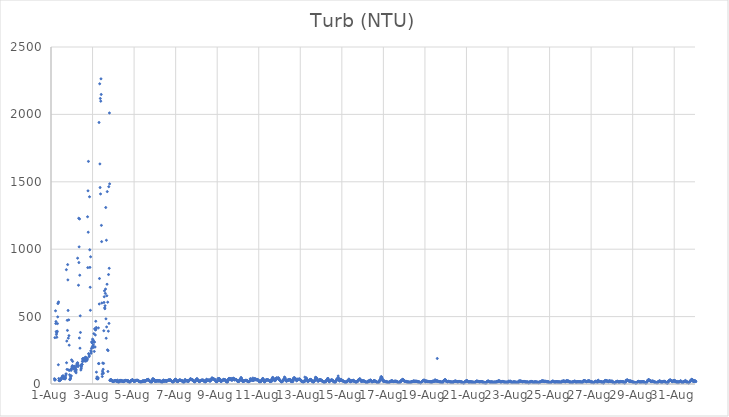
| Category | Turb (NTU) |
|---|---|
| 44774.166666666664 | 39.64 |
| 44774.177083333336 | 29.49 |
| 44774.1875 | 343.75 |
| 44774.197916666664 | 30 |
| 44774.208333333336 | 33.4 |
| 44774.21875 | 542.81 |
| 44774.229166666664 | 448.55 |
| 44774.239583333336 | 463.23 |
| 44774.25 | 389 |
| 44774.260416666664 | 366.88 |
| 44774.270833333336 | 378.59 |
| 44774.28125 | 346.4 |
| 44774.291666666664 | 385.65 |
| 44774.302083333336 | 391.27 |
| 44774.3125 | 447.91 |
| 44774.322916666664 | 498 |
| 44774.333333333336 | 596.85 |
| 44774.34375 | 601.07 |
| 44774.354166666664 | 142.81 |
| 44774.364583333336 | 608.79 |
| 44774.375 | 40.55 |
| 44774.385416666664 | 25.72 |
| 44774.395833333336 | 27.88 |
| 44774.40625 | 26.28 |
| 44774.416666666664 | 24.66 |
| 44774.427083333336 | 28.3 |
| 44774.4375 | 26.95 |
| 44774.447916666664 | 32.69 |
| 44774.458333333336 | 34.4 |
| 44774.46875 | 34.04 |
| 44774.479166666664 | 34.09 |
| 44774.489583333336 | 38.51 |
| 44774.5 | 38.87 |
| 44774.510416666664 | 40.91 |
| 44774.520833333336 | 49.12 |
| 44774.53125 | 48.4 |
| 44774.541666666664 | 52.52 |
| 44774.552083333336 | 58.51 |
| 44774.5625 | 52.9 |
| 44774.572916666664 | 54.88 |
| 44774.583333333336 | 60.88 |
| 44774.59375 | 56.37 |
| 44774.604166666664 | 54.12 |
| 44774.614583333336 | 48.3 |
| 44774.625 | 39.16 |
| 44774.635416666664 | 40.01 |
| 44774.645833333336 | 44.11 |
| 44774.65625 | 41.33 |
| 44774.666666666664 | 44.24 |
| 44774.677083333336 | 36.86 |
| 44774.6875 | 44.63 |
| 44774.697916666664 | 44.44 |
| 44774.708333333336 | 60.81 |
| 44774.71875 | 73.28 |
| 44774.729166666664 | 74.96 |
| 44774.739583333336 | 847.93 |
| 44774.75 | 157.62 |
| 44774.760416666664 | 318.34 |
| 44774.770833333336 | 108.39 |
| 44774.78125 | 472.36 |
| 44774.791666666664 | 397.58 |
| 44774.802083333336 | 885.79 |
| 44774.8125 | 772.22 |
| 44774.822916666664 | 545.61 |
| 44774.833333333336 | 340.16 |
| 44774.84375 | 104.51 |
| 44774.854166666664 | 475.64 |
| 44774.864583333336 | 358.76 |
| 44774.875 | 288.15 |
| 44774.885416666664 | 100.7 |
| 44774.895833333336 | 68.09 |
| 44774.90625 | 32.54 |
| 44774.916666666664 | 34.19 |
| 44774.927083333336 | 40.48 |
| 44774.9375 | 57.16 |
| 44774.947916666664 | 44.3 |
| 44774.958333333336 | 108.44 |
| 44774.96875 | 100.94 |
| 44774.979166666664 | 60.49 |
| 44774.989583333336 | 178.94 |
| 44775.0 | 117.27 |
| 44775.010416666664 | 126.28 |
| 44775.020833333336 | 128.56 |
| 44775.03125 | 136 |
| 44775.041666666664 | 167.64 |
| 44775.052083333336 | 131.18 |
| 44775.0625 | 122.96 |
| 44775.072916666664 | 111.94 |
| 44775.083333333336 | 116.35 |
| 44775.09375 | 129.78 |
| 44775.104166666664 | 121.05 |
| 44775.114583333336 | 131.84 |
| 44775.125 | 124.09 |
| 44775.135416666664 | 118.02 |
| 44775.145833333336 | 120.3 |
| 44775.15625 | 94.73 |
| 44775.166666666664 | 119.45 |
| 44775.177083333336 | 113.84 |
| 44775.1875 | 104.91 |
| 44775.197916666664 | 91.28 |
| 44775.208333333336 | 82.86 |
| 44775.21875 | 104.62 |
| 44775.229166666664 | 138.22 |
| 44775.239583333336 | 130.79 |
| 44775.25 | 150.78 |
| 44775.260416666664 | 144.89 |
| 44775.270833333336 | 157.25 |
| 44775.28125 | 933.41 |
| 44775.291666666664 | 155.7 |
| 44775.302083333336 | 129.28 |
| 44775.3125 | 140.03 |
| 44775.322916666664 | 732.73 |
| 44775.333333333336 | 1229.4 |
| 44775.34375 | 900.87 |
| 44775.354166666664 | 1017.32 |
| 44775.364583333336 | 341.19 |
| 44775.375 | 1224.41 |
| 44775.385416666664 | 807.12 |
| 44775.395833333336 | 265.68 |
| 44775.40625 | 505.68 |
| 44775.416666666664 | 382.37 |
| 44775.427083333336 | 135.81 |
| 44775.4375 | 103.84 |
| 44775.447916666664 | 112.31 |
| 44775.458333333336 | 118.88 |
| 44775.46875 | 130.75 |
| 44775.479166666664 | 146.87 |
| 44775.489583333336 | 144.89 |
| 44775.5 | 144.9 |
| 44775.510416666664 | 168.42 |
| 44775.520833333336 | 185.36 |
| 44775.53125 | 167.15 |
| 44775.541666666664 | 188.6 |
| 44775.552083333336 | 188.36 |
| 44775.5625 | 175.03 |
| 44775.572916666664 | 181.79 |
| 44775.583333333336 | 177.35 |
| 44775.59375 | 186.6 |
| 44775.604166666664 | 192.44 |
| 44775.614583333336 | 188.51 |
| 44775.625 | 187.43 |
| 44775.635416666664 | 172.45 |
| 44775.645833333336 | 168.81 |
| 44775.65625 | 198.53 |
| 44775.666666666664 | 192.33 |
| 44775.677083333336 | 191.73 |
| 44775.6875 | 182.39 |
| 44775.697916666664 | 195.37 |
| 44775.708333333336 | 172.12 |
| 44775.71875 | 182.09 |
| 44775.729166666664 | 180 |
| 44775.739583333336 | 178.01 |
| 44775.75 | 188.44 |
| 44775.760416666664 | 1240.64 |
| 44775.770833333336 | 863.31 |
| 44775.78125 | 1433.01 |
| 44775.791666666664 | 1126.01 |
| 44775.802083333336 | 1651.35 |
| 44775.8125 | 225.13 |
| 44775.822916666664 | 223.03 |
| 44775.833333333336 | 203.07 |
| 44775.84375 | 209.2 |
| 44775.854166666664 | 1388.83 |
| 44775.864583333336 | 995.66 |
| 44775.875 | 865.04 |
| 44775.885416666664 | 717.61 |
| 44775.895833333336 | 546.76 |
| 44775.90625 | 943.72 |
| 44775.916666666664 | 246.3 |
| 44775.927083333336 | 227.12 |
| 44775.9375 | 238.35 |
| 44775.947916666664 | 263.89 |
| 44775.958333333336 | 312.91 |
| 44775.96875 | 307.06 |
| 44775.979166666664 | 273.85 |
| 44775.989583333336 | 303.97 |
| 44776.0 | 332.7 |
| 44776.010416666664 | 281.81 |
| 44776.020833333336 | 313.37 |
| 44776.03125 | 325.6 |
| 44776.041666666664 | 289.59 |
| 44776.052083333336 | 271.32 |
| 44776.0625 | 373.22 |
| 44776.072916666664 | 314.95 |
| 44776.083333333336 | 241.73 |
| 44776.09375 | 310.02 |
| 44776.104166666664 | 409.22 |
| 44776.114583333336 | 407.71 |
| 44776.125 | 274.55 |
| 44776.135416666664 | 363.45 |
| 44776.145833333336 | 400.48 |
| 44776.15625 | 465.41 |
| 44776.166666666664 | 407.34 |
| 44776.177083333336 | 419.02 |
| 44776.1875 | 87.96 |
| 44776.197916666664 | 39.92 |
| 44776.208333333336 | 44.44 |
| 44776.21875 | 52.85 |
| 44776.229166666664 | 40.16 |
| 44776.239583333336 | 41.86 |
| 44776.25 | 37.81 |
| 44776.260416666664 | 38.15 |
| 44776.270833333336 | 45.25 |
| 44776.28125 | 416.27 |
| 44776.291666666664 | 151.71 |
| 44776.302083333336 | 151.39 |
| 44776.3125 | 1940.11 |
| 44776.322916666664 | 593.65 |
| 44776.333333333336 | 782.37 |
| 44776.34375 | 2227.01 |
| 44776.354166666664 | 1632.46 |
| 44776.364583333336 | 1457.48 |
| 44776.375 | 2118.02 |
| 44776.385416666664 | 1409.95 |
| 44776.395833333336 | 2098.01 |
| 44776.40625 | 2263.9 |
| 44776.416666666664 | 2148.02 |
| 44776.427083333336 | 1176.66 |
| 44776.4375 | 1056.24 |
| 44776.447916666664 | 600.7 |
| 44776.458333333336 | 73.83 |
| 44776.46875 | 55.41 |
| 44776.479166666664 | 95.75 |
| 44776.489583333336 | 155.37 |
| 44776.5 | 84.63 |
| 44776.510416666664 | 109.05 |
| 44776.520833333336 | 78.53 |
| 44776.53125 | 152.65 |
| 44776.541666666664 | 395 |
| 44776.552083333336 | 605.02 |
| 44776.5625 | 647.35 |
| 44776.572916666664 | 691.17 |
| 44776.583333333336 | 565.55 |
| 44776.59375 | 558.28 |
| 44776.604166666664 | 580.69 |
| 44776.614583333336 | 672.17 |
| 44776.625 | 704.15 |
| 44776.635416666664 | 1309.23 |
| 44776.645833333336 | 483.33 |
| 44776.65625 | 339.5 |
| 44776.666666666664 | 1066.35 |
| 44776.677083333336 | 423.31 |
| 44776.6875 | 654.82 |
| 44776.697916666664 | 740 |
| 44776.708333333336 | 1427.18 |
| 44776.71875 | 253.48 |
| 44776.729166666664 | 606.99 |
| 44776.739583333336 | 92.95 |
| 44776.75 | 247.96 |
| 44776.760416666664 | 391.8 |
| 44776.770833333336 | 811.92 |
| 44776.78125 | 1463.68 |
| 44776.791666666664 | 449.57 |
| 44776.802083333336 | 858.36 |
| 44776.8125 | 2010.73 |
| 44776.822916666664 | 1484.66 |
| 44776.833333333336 | 28.2 |
| 44776.84375 | 25.92 |
| 44776.854166666664 | 28.86 |
| 44776.864583333336 | 32.21 |
| 44776.875 | 32.67 |
| 44776.885416666664 | 28.52 |
| 44776.895833333336 | 32.18 |
| 44776.90625 | 26.48 |
| 44776.916666666664 | 26.51 |
| 44776.927083333336 | 27.24 |
| 44776.9375 | 22.49 |
| 44776.947916666664 | 21.96 |
| 44776.958333333336 | 22.24 |
| 44776.96875 | 18.54 |
| 44776.979166666664 | 18.39 |
| 44776.989583333336 | 16.93 |
| 44777.0 | 17.83 |
| 44777.010416666664 | 20 |
| 44777.020833333336 | 19.98 |
| 44777.03125 | 22.9 |
| 44777.041666666664 | 22.95 |
| 44777.052083333336 | 22.93 |
| 44777.0625 | 24.94 |
| 44777.072916666664 | 25.53 |
| 44777.083333333336 | 27.63 |
| 44777.09375 | 24.48 |
| 44777.104166666664 | 25.06 |
| 44777.114583333336 | 25.37 |
| 44777.125 | 22.61 |
| 44777.135416666664 | 24.18 |
| 44777.145833333336 | 22.41 |
| 44777.15625 | 21.91 |
| 44777.166666666664 | 21.86 |
| 44777.177083333336 | 21.95 |
| 44777.1875 | 20.81 |
| 44777.197916666664 | 18.48 |
| 44777.208333333336 | 29.01 |
| 44777.21875 | 18.15 |
| 44777.229166666664 | 15.44 |
| 44777.239583333336 | 13.22 |
| 44777.25 | 13.64 |
| 44777.260416666664 | 16.74 |
| 44777.270833333336 | 18.9 |
| 44777.28125 | 17.37 |
| 44777.291666666664 | 15.93 |
| 44777.302083333336 | 18.65 |
| 44777.3125 | 23.11 |
| 44777.322916666664 | 27.88 |
| 44777.333333333336 | 26.24 |
| 44777.34375 | 24.51 |
| 44777.354166666664 | 23.02 |
| 44777.364583333336 | 25.14 |
| 44777.375 | 23.44 |
| 44777.385416666664 | 26.29 |
| 44777.395833333336 | 21.91 |
| 44777.40625 | 23.1 |
| 44777.416666666664 | 22.91 |
| 44777.427083333336 | 19.35 |
| 44777.4375 | 22.28 |
| 44777.447916666664 | 22.15 |
| 44777.458333333336 | 19.94 |
| 44777.46875 | 19.51 |
| 44777.479166666664 | 20.19 |
| 44777.489583333336 | 17.59 |
| 44777.5 | 18.17 |
| 44777.510416666664 | 18.55 |
| 44777.520833333336 | 25.78 |
| 44777.53125 | 23.03 |
| 44777.541666666664 | 22.67 |
| 44777.552083333336 | 24.82 |
| 44777.5625 | 24.93 |
| 44777.572916666664 | 26.02 |
| 44777.583333333336 | 27.19 |
| 44777.59375 | 23.31 |
| 44777.604166666664 | 24.3 |
| 44777.614583333336 | 23.43 |
| 44777.625 | 26.28 |
| 44777.635416666664 | 25.19 |
| 44777.645833333336 | 24.85 |
| 44777.65625 | 24.41 |
| 44777.666666666664 | 25.37 |
| 44777.677083333336 | 22.31 |
| 44777.6875 | 23.49 |
| 44777.697916666664 | 20.06 |
| 44777.708333333336 | 20.73 |
| 44777.71875 | 24.73 |
| 44777.729166666664 | 20.58 |
| 44777.739583333336 | 21.12 |
| 44777.75 | 16.46 |
| 44777.760416666664 | 15.09 |
| 44777.770833333336 | 12.92 |
| 44777.78125 | 12.91 |
| 44777.791666666664 | 13.31 |
| 44777.802083333336 | 13.36 |
| 44777.8125 | 17.77 |
| 44777.822916666664 | 19.4 |
| 44777.833333333336 | 22.31 |
| 44777.84375 | 24.76 |
| 44777.854166666664 | 24.55 |
| 44777.864583333336 | 26.44 |
| 44777.875 | 26.97 |
| 44777.885416666664 | 24.75 |
| 44777.895833333336 | 26.06 |
| 44777.90625 | 29.63 |
| 44777.916666666664 | 32.61 |
| 44777.927083333336 | 29.68 |
| 44777.9375 | 29.16 |
| 44777.947916666664 | 27.05 |
| 44777.958333333336 | 26.28 |
| 44777.96875 | 24.08 |
| 44777.979166666664 | 20.38 |
| 44777.989583333336 | 20.87 |
| 44778.0 | 21.48 |
| 44778.010416666664 | 21.46 |
| 44778.020833333336 | 20.14 |
| 44778.03125 | 19.72 |
| 44778.041666666664 | 20.67 |
| 44778.052083333336 | 21.99 |
| 44778.0625 | 26.86 |
| 44778.072916666664 | 25.33 |
| 44778.083333333336 | 26.08 |
| 44778.09375 | 24.47 |
| 44778.104166666664 | 25.07 |
| 44778.114583333336 | 26.1 |
| 44778.125 | 27.08 |
| 44778.135416666664 | 27.34 |
| 44778.145833333336 | 29.23 |
| 44778.15625 | 26.98 |
| 44778.166666666664 | 25.42 |
| 44778.177083333336 | 25.6 |
| 44778.1875 | 24.57 |
| 44778.197916666664 | 25.76 |
| 44778.208333333336 | 23.83 |
| 44778.21875 | 20.6 |
| 44778.229166666664 | 20.6 |
| 44778.239583333336 | 18.85 |
| 44778.25 | 17.88 |
| 44778.260416666664 | 19.64 |
| 44778.270833333336 | 16.89 |
| 44778.28125 | 16.39 |
| 44778.291666666664 | 15.57 |
| 44778.302083333336 | 14.63 |
| 44778.3125 | 14.58 |
| 44778.322916666664 | 16.35 |
| 44778.333333333336 | 16.39 |
| 44778.34375 | 16.96 |
| 44778.354166666664 | 17.45 |
| 44778.364583333336 | 14.93 |
| 44778.375 | 19.86 |
| 44778.385416666664 | 16.44 |
| 44778.395833333336 | 18.63 |
| 44778.40625 | 21.94 |
| 44778.416666666664 | 20.59 |
| 44778.427083333336 | 23.69 |
| 44778.4375 | 19.83 |
| 44778.447916666664 | 20.82 |
| 44778.458333333336 | 21.47 |
| 44778.46875 | 20.3 |
| 44778.479166666664 | 22.93 |
| 44778.489583333336 | 24.6 |
| 44778.5 | 22.45 |
| 44778.510416666664 | 21.43 |
| 44778.520833333336 | 19.02 |
| 44778.53125 | 19.92 |
| 44778.541666666664 | 21.89 |
| 44778.552083333336 | 24.38 |
| 44778.5625 | 24.25 |
| 44778.572916666664 | 24.54 |
| 44778.583333333336 | 25.56 |
| 44778.59375 | 24.62 |
| 44778.604166666664 | 27.36 |
| 44778.614583333336 | 30.33 |
| 44778.625 | 31.84 |
| 44778.635416666664 | 31.54 |
| 44778.645833333336 | 32.99 |
| 44778.65625 | 31.66 |
| 44778.666666666664 | 33.48 |
| 44778.677083333336 | 35.28 |
| 44778.6875 | 30.57 |
| 44778.697916666664 | 27.21 |
| 44778.708333333336 | 25.19 |
| 44778.71875 | 26.53 |
| 44778.729166666664 | 25.97 |
| 44778.739583333336 | 24.68 |
| 44778.75 | 22.19 |
| 44778.760416666664 | 21.18 |
| 44778.770833333336 | 20.47 |
| 44778.78125 | 18.44 |
| 44778.791666666664 | 17.36 |
| 44778.802083333336 | 16.29 |
| 44778.8125 | 14.83 |
| 44778.822916666664 | 13.38 |
| 44778.833333333336 | 12.47 |
| 44778.84375 | 12.78 |
| 44778.854166666664 | 19.14 |
| 44778.864583333336 | 21.14 |
| 44778.875 | 26.38 |
| 44778.885416666664 | 31.53 |
| 44778.895833333336 | 39.58 |
| 44778.90625 | 25.45 |
| 44778.916666666664 | 37.96 |
| 44778.927083333336 | 27.51 |
| 44778.9375 | 36.11 |
| 44778.947916666664 | 33.23 |
| 44778.958333333336 | 29.45 |
| 44778.96875 | 31.62 |
| 44778.979166666664 | 28.3 |
| 44778.989583333336 | 23.62 |
| 44779.0 | 20.22 |
| 44779.010416666664 | 19.85 |
| 44779.020833333336 | 21.3 |
| 44779.03125 | 24.31 |
| 44779.041666666664 | 26.28 |
| 44779.052083333336 | 21.26 |
| 44779.0625 | 18.94 |
| 44779.072916666664 | 24.14 |
| 44779.083333333336 | 25.21 |
| 44779.09375 | 24.64 |
| 44779.104166666664 | 25.42 |
| 44779.114583333336 | 25.65 |
| 44779.125 | 23.64 |
| 44779.135416666664 | 22.81 |
| 44779.145833333336 | 22.08 |
| 44779.15625 | 22.07 |
| 44779.166666666664 | 21.76 |
| 44779.177083333336 | 23.47 |
| 44779.1875 | 24.53 |
| 44779.197916666664 | 24.91 |
| 44779.208333333336 | 25.54 |
| 44779.21875 | 24.35 |
| 44779.229166666664 | 23.73 |
| 44779.239583333336 | 22.76 |
| 44779.25 | 23.42 |
| 44779.260416666664 | 21.71 |
| 44779.270833333336 | 18.66 |
| 44779.28125 | 19.19 |
| 44779.291666666664 | 15.53 |
| 44779.302083333336 | 16.21 |
| 44779.3125 | 15.66 |
| 44779.322916666664 | 21.08 |
| 44779.333333333336 | 16.62 |
| 44779.34375 | 16.29 |
| 44779.354166666664 | 13.74 |
| 44779.364583333336 | 14.75 |
| 44779.375 | 19.15 |
| 44779.385416666664 | 18.52 |
| 44779.395833333336 | 25.83 |
| 44779.40625 | 24.16 |
| 44779.416666666664 | 29.48 |
| 44779.427083333336 | 27.05 |
| 44779.4375 | 23.97 |
| 44779.447916666664 | 22.44 |
| 44779.458333333336 | 22.7 |
| 44779.46875 | 20.39 |
| 44779.479166666664 | 22.51 |
| 44779.489583333336 | 22.28 |
| 44779.5 | 23.9 |
| 44779.510416666664 | 26.09 |
| 44779.520833333336 | 24.08 |
| 44779.53125 | 22.42 |
| 44779.541666666664 | 21.75 |
| 44779.552083333336 | 18.89 |
| 44779.5625 | 19.58 |
| 44779.572916666664 | 20.99 |
| 44779.583333333336 | 23.35 |
| 44779.59375 | 26.36 |
| 44779.604166666664 | 25.3 |
| 44779.614583333336 | 26.45 |
| 44779.625 | 26.3 |
| 44779.635416666664 | 26.36 |
| 44779.645833333336 | 28.36 |
| 44779.65625 | 28.86 |
| 44779.666666666664 | 28 |
| 44779.677083333336 | 30.15 |
| 44779.6875 | 29.37 |
| 44779.697916666664 | 29.18 |
| 44779.708333333336 | 28.98 |
| 44779.71875 | 26.95 |
| 44779.729166666664 | 29.7 |
| 44779.739583333336 | 32.09 |
| 44779.75 | 29.95 |
| 44779.760416666664 | 27.62 |
| 44779.770833333336 | 26.67 |
| 44779.78125 | 24.71 |
| 44779.791666666664 | 24.14 |
| 44779.802083333336 | 20.82 |
| 44779.8125 | 20.77 |
| 44779.822916666664 | 19.02 |
| 44779.833333333336 | 17.43 |
| 44779.84375 | 15.54 |
| 44779.854166666664 | 15.04 |
| 44779.864583333336 | 13.36 |
| 44779.875 | 15.18 |
| 44779.885416666664 | 14.92 |
| 44779.895833333336 | 19.34 |
| 44779.90625 | 19.68 |
| 44779.916666666664 | 22.19 |
| 44779.927083333336 | 24.38 |
| 44779.9375 | 26.14 |
| 44779.947916666664 | 27.36 |
| 44779.958333333336 | 29.2 |
| 44779.96875 | 32.59 |
| 44779.979166666664 | 33.27 |
| 44779.989583333336 | 36.06 |
| 44780.0 | 32.14 |
| 44780.010416666664 | 30.98 |
| 44780.020833333336 | 30.12 |
| 44780.03125 | 28.97 |
| 44780.041666666664 | 27.01 |
| 44780.052083333336 | 23.65 |
| 44780.0625 | 20.68 |
| 44780.072916666664 | 19.77 |
| 44780.083333333336 | 18.6 |
| 44780.09375 | 17.27 |
| 44780.104166666664 | 17.65 |
| 44780.114583333336 | 19.15 |
| 44780.125 | 23.35 |
| 44780.135416666664 | 23.99 |
| 44780.145833333336 | 25.91 |
| 44780.15625 | 25.74 |
| 44780.166666666664 | 28.09 |
| 44780.177083333336 | 29.21 |
| 44780.1875 | 28.32 |
| 44780.197916666664 | 29.52 |
| 44780.208333333336 | 28.57 |
| 44780.21875 | 30.27 |
| 44780.229166666664 | 27.72 |
| 44780.239583333336 | 26.54 |
| 44780.25 | 26.31 |
| 44780.260416666664 | 25.24 |
| 44780.270833333336 | 25.65 |
| 44780.28125 | 25.65 |
| 44780.291666666664 | 25.51 |
| 44780.302083333336 | 23.49 |
| 44780.3125 | 23.11 |
| 44780.322916666664 | 20.71 |
| 44780.333333333336 | 20.9 |
| 44780.34375 | 17.69 |
| 44780.354166666664 | 15.28 |
| 44780.364583333336 | 14.29 |
| 44780.375 | 13.45 |
| 44780.385416666664 | 13.88 |
| 44780.395833333336 | 16.5 |
| 44780.40625 | 13.85 |
| 44780.416666666664 | 16.2 |
| 44780.427083333336 | 19.53 |
| 44780.4375 | 29.33 |
| 44780.447916666664 | 28.59 |
| 44780.458333333336 | 33.27 |
| 44780.46875 | 27.12 |
| 44780.479166666664 | 26.81 |
| 44780.489583333336 | 23.73 |
| 44780.5 | 24.43 |
| 44780.510416666664 | 23.8 |
| 44780.520833333336 | 25.07 |
| 44780.53125 | 22.36 |
| 44780.541666666664 | 26.82 |
| 44780.552083333336 | 24.99 |
| 44780.5625 | 24.29 |
| 44780.572916666664 | 22.87 |
| 44780.583333333336 | 21.65 |
| 44780.59375 | 20.57 |
| 44780.604166666664 | 20 |
| 44780.614583333336 | 18.24 |
| 44780.625 | 22.46 |
| 44780.635416666664 | 22.84 |
| 44780.645833333336 | 26.62 |
| 44780.65625 | 27.07 |
| 44780.666666666664 | 28.09 |
| 44780.677083333336 | 30.67 |
| 44780.6875 | 32.14 |
| 44780.697916666664 | 36.49 |
| 44780.708333333336 | 38.56 |
| 44780.71875 | 35.88 |
| 44780.729166666664 | 37.45 |
| 44780.739583333336 | 35.75 |
| 44780.75 | 34.31 |
| 44780.760416666664 | 33.96 |
| 44780.770833333336 | 32.64 |
| 44780.78125 | 31.79 |
| 44780.791666666664 | 29.36 |
| 44780.802083333336 | 30.29 |
| 44780.8125 | 30.67 |
| 44780.822916666664 | 31.07 |
| 44780.833333333336 | 25.37 |
| 44780.84375 | 26.19 |
| 44780.854166666664 | 23.99 |
| 44780.864583333336 | 23.03 |
| 44780.875 | 21.52 |
| 44780.885416666664 | 18.78 |
| 44780.895833333336 | 17 |
| 44780.90625 | 17.75 |
| 44780.916666666664 | 14.55 |
| 44780.927083333336 | 17.9 |
| 44780.9375 | 16.07 |
| 44780.947916666664 | 22.92 |
| 44780.958333333336 | 24.28 |
| 44780.96875 | 27.53 |
| 44780.979166666664 | 30.71 |
| 44780.989583333336 | 33.68 |
| 44781.0 | 29.5 |
| 44781.010416666664 | 35.68 |
| 44781.020833333336 | 35.81 |
| 44781.03125 | 40.46 |
| 44781.041666666664 | 32.54 |
| 44781.052083333336 | 31.15 |
| 44781.0625 | 30.22 |
| 44781.072916666664 | 31 |
| 44781.083333333336 | 26.57 |
| 44781.09375 | 25.01 |
| 44781.104166666664 | 22.48 |
| 44781.114583333336 | 20.8 |
| 44781.125 | 18.06 |
| 44781.135416666664 | 17.52 |
| 44781.145833333336 | 17.27 |
| 44781.15625 | 18.56 |
| 44781.166666666664 | 21.21 |
| 44781.177083333336 | 24.95 |
| 44781.1875 | 24.15 |
| 44781.197916666664 | 26.03 |
| 44781.208333333336 | 24.16 |
| 44781.21875 | 26.34 |
| 44781.229166666664 | 27.82 |
| 44781.239583333336 | 26.52 |
| 44781.25 | 28.35 |
| 44781.260416666664 | 27.14 |
| 44781.270833333336 | 28.96 |
| 44781.28125 | 29.27 |
| 44781.291666666664 | 26.31 |
| 44781.302083333336 | 27.37 |
| 44781.3125 | 30.55 |
| 44781.322916666664 | 28.7 |
| 44781.333333333336 | 26.06 |
| 44781.34375 | 25.06 |
| 44781.354166666664 | 21.69 |
| 44781.364583333336 | 22.53 |
| 44781.375 | 22.62 |
| 44781.385416666664 | 21.09 |
| 44781.395833333336 | 18.46 |
| 44781.40625 | 15.36 |
| 44781.416666666664 | 18.58 |
| 44781.427083333336 | 15.15 |
| 44781.4375 | 15.84 |
| 44781.447916666664 | 18.62 |
| 44781.458333333336 | 25.82 |
| 44781.46875 | 29.7 |
| 44781.479166666664 | 22.52 |
| 44781.489583333336 | 35.39 |
| 44781.5 | 31.09 |
| 44781.510416666664 | 27.29 |
| 44781.520833333336 | 27.65 |
| 44781.53125 | 28.91 |
| 44781.541666666664 | 25.55 |
| 44781.55210648148 | 25.52 |
| 44781.5625 | 26.21 |
| 44781.572916666664 | 25.73 |
| 44781.583333333336 | 28.29 |
| 44781.59375 | 30.04 |
| 44781.604166666664 | 29.49 |
| 44781.614583333336 | 23.44 |
| 44781.625 | 25.98 |
| 44781.635416666664 | 31.28 |
| 44781.645833333336 | 23.66 |
| 44781.65625 | 19.69 |
| 44781.666666666664 | 23.84 |
| 44781.677083333336 | 27.04 |
| 44781.6875 | 30.27 |
| 44781.697916666664 | 27.7 |
| 44781.708333333336 | 33.34 |
| 44781.71875 | 30.07 |
| 44781.729166666664 | 36.31 |
| 44781.739583333336 | 39.67 |
| 44781.75 | 46.39 |
| 44781.760416666664 | 42.37 |
| 44781.770833333336 | 38.59 |
| 44781.78125 | 39.69 |
| 44781.791666666664 | 38.06 |
| 44781.802083333336 | 36.14 |
| 44781.8125 | 39.71 |
| 44781.822916666664 | 36.1 |
| 44781.833333333336 | 36.67 |
| 44781.84375 | 35.84 |
| 44781.854166666664 | 34.03 |
| 44781.864583333336 | 34.54 |
| 44781.875 | 34.55 |
| 44781.885416666664 | 31.54 |
| 44781.895833333336 | 29.33 |
| 44781.90625 | 29.15 |
| 44781.916666666664 | 24.82 |
| 44781.927083333336 | 24.65 |
| 44781.9375 | 20.72 |
| 44781.947916666664 | 16.14 |
| 44781.958333333336 | 17.42 |
| 44781.96875 | 17.68 |
| 44781.979166666664 | 17.62 |
| 44781.989583333336 | 20.64 |
| 44782.0 | 18.11 |
| 44782.010416666664 | 21.6 |
| 44782.020833333336 | 25.19 |
| 44782.03125 | 40.21 |
| 44782.041666666664 | 35.71 |
| 44782.052083333336 | 30.91 |
| 44782.0625 | 35.94 |
| 44782.072916666664 | 35.74 |
| 44782.083333333336 | 42.02 |
| 44782.09375 | 36.93 |
| 44782.104166666664 | 39.29 |
| 44782.114583333336 | 37.51 |
| 44782.125 | 35.2 |
| 44782.135416666664 | 29.12 |
| 44782.145833333336 | 27.69 |
| 44782.15625 | 24.23 |
| 44782.166666666664 | 20.68 |
| 44782.177083333336 | 18.72 |
| 44782.1875 | 17.67 |
| 44782.197916666664 | 18.62 |
| 44782.208333333336 | 22.48 |
| 44782.21875 | 27.05 |
| 44782.229166666664 | 25.88 |
| 44782.239583333336 | 26.12 |
| 44782.25 | 24.88 |
| 44782.260416666664 | 25.69 |
| 44782.270833333336 | 29.62 |
| 44782.28125 | 29.41 |
| 44782.291666666664 | 30.69 |
| 44782.302083333336 | 30.72 |
| 44782.3125 | 34.63 |
| 44782.322916666664 | 33.28 |
| 44782.333333333336 | 32.37 |
| 44782.34375 | 30.43 |
| 44782.354166666664 | 31.99 |
| 44782.364583333336 | 32.06 |
| 44782.375 | 31.59 |
| 44782.385416666664 | 29.17 |
| 44782.395833333336 | 27.75 |
| 44782.40625 | 24.96 |
| 44782.416666666664 | 23.8 |
| 44782.427083333336 | 20.84 |
| 44782.4375 | 19.67 |
| 44782.447916666664 | 18.53 |
| 44782.458333333336 | 14.46 |
| 44782.46875 | 15.44 |
| 44782.479166666664 | 13.07 |
| 44782.489583333336 | 15.22 |
| 44782.5 | 17.38 |
| 44782.510416666664 | 21.51 |
| 44782.520833333336 | 28.73 |
| 44782.53125 | 34.59 |
| 44782.541666666664 | 33.59 |
| 44782.552083333336 | 37.21 |
| 44782.5625 | 40.24 |
| 44782.572916666664 | 35.95 |
| 44782.583333333336 | 40.8 |
| 44782.59375 | 41.02 |
| 44782.604166666664 | 36.64 |
| 44782.614583333336 | 33.16 |
| 44782.625 | 35.76 |
| 44782.635416666664 | 36.94 |
| 44782.645833333336 | 39.36 |
| 44782.65625 | 33.34 |
| 44782.666666666664 | 29.8 |
| 44782.677083333336 | 40.8 |
| 44782.6875 | 30.6 |
| 44782.697916666664 | 30.99 |
| 44782.708333333336 | 28.62 |
| 44782.71875 | 30.34 |
| 44782.729166666664 | 31.32 |
| 44782.739583333336 | 30.85 |
| 44782.75 | 41.32 |
| 44782.760416666664 | 37.01 |
| 44782.770833333336 | 37.58 |
| 44782.78125 | 41.56 |
| 44782.791666666664 | 42.64 |
| 44782.802083333336 | 40.39 |
| 44782.8125 | 35.39 |
| 44782.822916666664 | 31.65 |
| 44782.833333333336 | 30.47 |
| 44782.84375 | 32 |
| 44782.854166666664 | 32.49 |
| 44782.864583333336 | 32.92 |
| 44782.875 | 33.56 |
| 44782.885416666664 | 33.93 |
| 44782.895833333336 | 32.43 |
| 44782.90625 | 32.65 |
| 44782.916666666664 | 30.85 |
| 44782.927083333336 | 28.12 |
| 44782.9375 | 30.02 |
| 44782.947916666664 | 28.24 |
| 44782.958333333336 | 24.29 |
| 44782.96875 | 22.57 |
| 44782.979166666664 | 20.74 |
| 44782.989583333336 | 18.61 |
| 44783.0 | 18.29 |
| 44783.010416666664 | 18.53 |
| 44783.020833333336 | 18.4 |
| 44783.03125 | 18.41 |
| 44783.041666666664 | 24.33 |
| 44783.052083333336 | 24.1 |
| 44783.0625 | 19.63 |
| 44783.072916666664 | 28.21 |
| 44783.083333333336 | 28.92 |
| 44783.09375 | 30.22 |
| 44783.104166666664 | 30.9 |
| 44783.114583333336 | 38.73 |
| 44783.125 | 37.09 |
| 44783.135416666664 | 40.71 |
| 44783.145833333336 | 48.61 |
| 44783.15625 | 42.04 |
| 44783.166666666664 | 43.63 |
| 44783.177083333336 | 37.02 |
| 44783.1875 | 32.71 |
| 44783.197916666664 | 29.38 |
| 44783.208333333336 | 29.5 |
| 44783.21875 | 21.3 |
| 44783.229166666664 | 18.16 |
| 44783.239583333336 | 19 |
| 44783.25 | 19.91 |
| 44783.260416666664 | 23.49 |
| 44783.270833333336 | 22.81 |
| 44783.28125 | 22.08 |
| 44783.291666666664 | 21.66 |
| 44783.302083333336 | 21.77 |
| 44783.3125 | 23.19 |
| 44783.322916666664 | 24.4 |
| 44783.333333333336 | 24.56 |
| 44783.34375 | 25.06 |
| 44783.354166666664 | 25.55 |
| 44783.364583333336 | 27.66 |
| 44783.375 | 26.25 |
| 44783.385416666664 | 25.73 |
| 44783.395833333336 | 27.98 |
| 44783.40625 | 25.04 |
| 44783.416666666664 | 25.33 |
| 44783.427083333336 | 23.43 |
| 44783.4375 | 25.26 |
| 44783.447916666664 | 22.33 |
| 44783.458333333336 | 20.89 |
| 44783.46875 | 21.55 |
| 44783.479166666664 | 17.46 |
| 44783.489583333336 | 16.26 |
| 44783.5 | 17.26 |
| 44783.510416666664 | 18.86 |
| 44783.520833333336 | 18.12 |
| 44783.53125 | 18.1 |
| 44783.541666666664 | 18.12 |
| 44783.552083333336 | 20.68 |
| 44783.5625 | 20.4 |
| 44783.572916666664 | 22.19 |
| 44783.583333333336 | 27.14 |
| 44783.59375 | 39.43 |
| 44783.604166666664 | 36.48 |
| 44783.614583333336 | 31.31 |
| 44783.625 | 30.02 |
| 44783.635416666664 | 36.46 |
| 44783.645833333336 | 33.39 |
| 44783.65625 | 28.84 |
| 44783.666666666664 | 29.63 |
| 44783.677083333336 | 30.18 |
| 44783.6875 | 27.87 |
| 44783.697916666664 | 28.45 |
| 44783.708333333336 | 27.07 |
| 44783.71875 | 44.55 |
| 44783.729166666664 | 32.47 |
| 44783.739583333336 | 26.69 |
| 44783.75 | 26.4 |
| 44783.760416666664 | 29.61 |
| 44783.770833333336 | 33.1 |
| 44783.78125 | 30.17 |
| 44783.791666666664 | 34.42 |
| 44783.802083333336 | 40.21 |
| 44783.8125 | 35.97 |
| 44783.822916666664 | 37.33 |
| 44783.833333333336 | 37.24 |
| 44783.84375 | 35.53 |
| 44783.854166666664 | 32.03 |
| 44783.864583333336 | 31.19 |
| 44783.875 | 30.31 |
| 44783.885416666664 | 31.62 |
| 44783.895833333336 | 31.77 |
| 44783.90625 | 34.88 |
| 44783.916666666664 | 35.09 |
| 44783.927083333336 | 33.73 |
| 44783.9375 | 32.44 |
| 44783.947916666664 | 30.95 |
| 44783.958333333336 | 30.35 |
| 44783.96875 | 29.6 |
| 44783.979166666664 | 28.3 |
| 44783.989583333336 | 26.25 |
| 44784.0 | 23.23 |
| 44784.010416666664 | 23.52 |
| 44784.020833333336 | 18.26 |
| 44784.03125 | 17.4 |
| 44784.041666666664 | 17.17 |
| 44784.052083333336 | 16.52 |
| 44784.0625 | 16.17 |
| 44784.072916666664 | 16.82 |
| 44784.083333333336 | 17.8 |
| 44784.09375 | 18.27 |
| 44784.104166666664 | 21.88 |
| 44784.114583333336 | 21.7 |
| 44784.125 | 24.56 |
| 44784.135416666664 | 22.98 |
| 44784.145833333336 | 30.27 |
| 44784.15625 | 30.31 |
| 44784.166666666664 | 34.86 |
| 44784.177083333336 | 37.22 |
| 44784.1875 | 39.8 |
| 44784.197916666664 | 41.33 |
| 44784.208333333336 | 36.99 |
| 44784.21875 | 34.24 |
| 44784.229166666664 | 32.15 |
| 44784.239583333336 | 29.56 |
| 44784.25 | 24.89 |
| 44784.260416666664 | 20.59 |
| 44784.270833333336 | 15.93 |
| 44784.28125 | 16.53 |
| 44784.291666666664 | 14.97 |
| 44784.302083333336 | 19.66 |
| 44784.3125 | 22.79 |
| 44784.322916666664 | 26.26 |
| 44784.333333333336 | 28.05 |
| 44784.34375 | 27.23 |
| 44784.354166666664 | 30.11 |
| 44784.364583333336 | 28.48 |
| 44784.375 | 31.62 |
| 44784.385416666664 | 30.37 |
| 44784.395833333336 | 30.29 |
| 44784.40625 | 31.45 |
| 44784.416666666664 | 30.91 |
| 44784.427083333336 | 30.95 |
| 44784.4375 | 30.47 |
| 44784.447916666664 | 28.6 |
| 44784.458333333336 | 30.04 |
| 44784.46875 | 28.02 |
| 44784.479166666664 | 26.72 |
| 44784.489583333336 | 26.06 |
| 44784.5 | 24.59 |
| 44784.510416666664 | 25.22 |
| 44784.520833333336 | 22.63 |
| 44784.53125 | 20.49 |
| 44784.541666666664 | 19.79 |
| 44784.552083333336 | 17.73 |
| 44784.5625 | 19.1 |
| 44784.572916666664 | 17.61 |
| 44784.583333333336 | 19.25 |
| 44784.59375 | 20.41 |
| 44784.604166666664 | 29.74 |
| 44784.614583333336 | 27.93 |
| 44784.625 | 34.85 |
| 44784.635416666664 | 37.74 |
| 44784.645833333336 | 22.78 |
| 44784.65625 | 33.22 |
| 44784.666666666664 | 48.78 |
| 44784.677083333336 | 45.39 |
| 44784.6875 | 46.24 |
| 44784.697916666664 | 36.72 |
| 44784.708333333336 | 32.09 |
| 44784.71875 | 35.03 |
| 44784.729166666664 | 35.65 |
| 44784.739583333336 | 34.37 |
| 44784.75 | 34.54 |
| 44784.760416666664 | 34.57 |
| 44784.770833333336 | 25.5 |
| 44784.78125 | 23.08 |
| 44784.791666666664 | 26.74 |
| 44784.802083333336 | 27 |
| 44784.8125 | 30.04 |
| 44784.822916666664 | 34.92 |
| 44784.833333333336 | 32.05 |
| 44784.84375 | 43.11 |
| 44784.854166666664 | 44.85 |
| 44784.864583333336 | 43.62 |
| 44784.875 | 41.22 |
| 44784.885416666664 | 41.07 |
| 44784.895833333336 | 41.27 |
| 44784.90625 | 41.62 |
| 44784.916666666664 | 41.51 |
| 44784.927083333336 | 45.14 |
| 44784.9375 | 44.31 |
| 44784.947916666664 | 45.74 |
| 44784.958333333336 | 40.61 |
| 44784.96875 | 40.58 |
| 44784.979166666664 | 35.47 |
| 44784.989583333336 | 32.6 |
| 44785.0 | 31.2 |
| 44785.010416666664 | 28.79 |
| 44785.020833333336 | 26.83 |
| 44785.03125 | 25.75 |
| 44785.041666666664 | 23.43 |
| 44785.052083333336 | 24.61 |
| 44785.0625 | 20.78 |
| 44785.072916666664 | 17.4 |
| 44785.083333333336 | 17.16 |
| 44785.09375 | 16.68 |
| 44785.104166666664 | 14.71 |
| 44785.114583333336 | 16.59 |
| 44785.125 | 17.81 |
| 44785.135416666664 | 18.15 |
| 44785.145833333336 | 20.67 |
| 44785.15625 | 26.52 |
| 44785.166666666664 | 21.87 |
| 44785.177083333336 | 26.54 |
| 44785.1875 | 29.25 |
| 44785.197916666664 | 34.32 |
| 44785.208333333336 | 31.87 |
| 44785.21875 | 38.58 |
| 44785.229166666664 | 35.39 |
| 44785.239583333336 | 51.61 |
| 44785.25 | 41.55 |
| 44785.260416666664 | 46.25 |
| 44785.270833333336 | 43.66 |
| 44785.28125 | 36.93 |
| 44785.291666666664 | 29.87 |
| 44785.302083333336 | 27.91 |
| 44785.3125 | 24.8 |
| 44785.322916666664 | 20.92 |
| 44785.333333333336 | 22.17 |
| 44785.34375 | 23.2 |
| 44785.354166666664 | 22.79 |
| 44785.364583333336 | 23.98 |
| 44785.375 | 26.28 |
| 44785.385416666664 | 26.57 |
| 44785.395833333336 | 28.87 |
| 44785.40625 | 28.17 |
| 44785.416666666664 | 29.64 |
| 44785.427083333336 | 28.09 |
| 44785.4375 | 29.2 |
| 44785.447916666664 | 32.24 |
| 44785.458333333336 | 31.36 |
| 44785.46875 | 34.1 |
| 44785.479166666664 | 32.32 |
| 44785.489583333336 | 32.04 |
| 44785.5 | 32.41 |
| 44785.510416666664 | 30.19 |
| 44785.520833333336 | 29.05 |
| 44785.53125 | 31.14 |
| 44785.541666666664 | 22.85 |
| 44785.552083333336 | 23.05 |
| 44785.5625 | 18.87 |
| 44785.572916666664 | 17.83 |
| 44785.583333333336 | 25.77 |
| 44785.59375 | 17.8 |
| 44785.604166666664 | 16.74 |
| 44785.614583333336 | 17.91 |
| 44785.625 | 18.17 |
| 44785.635416666664 | 33.79 |
| 44785.645833333336 | 18.72 |
| 44785.65625 | 26.16 |
| 44785.666666666664 | 33.21 |
| 44785.677083333336 | 41.56 |
| 44785.6875 | 46.52 |
| 44785.697916666664 | 38.36 |
| 44785.708333333336 | 42.74 |
| 44785.71875 | 44.93 |
| 44785.729166666664 | 46.1 |
| 44785.739583333336 | 35.86 |
| 44785.75 | 35.98 |
| 44785.760416666664 | 37.14 |
| 44785.770833333336 | 34.46 |
| 44785.78125 | 38.62 |
| 44785.791666666664 | 30.83 |
| 44785.802083333336 | 32.33 |
| 44785.8125 | 32.24 |
| 44785.822916666664 | 23.22 |
| 44785.833333333336 | 26.45 |
| 44785.84375 | 28.08 |
| 44785.854166666664 | 31.84 |
| 44785.864583333336 | 33.35 |
| 44785.875 | 36.32 |
| 44785.885416666664 | 33.49 |
| 44785.895833333336 | 34.56 |
| 44785.90625 | 35.11 |
| 44785.916666666664 | 33 |
| 44785.927083333336 | 33.5 |
| 44785.9375 | 35.52 |
| 44785.947916666664 | 35.28 |
| 44785.958333333336 | 36.96 |
| 44785.96875 | 36.94 |
| 44785.979166666664 | 35.05 |
| 44785.989583333336 | 33.95 |
| 44786.0 | 32.08 |
| 44786.010416666664 | 29.71 |
| 44786.020833333336 | 27.31 |
| 44786.03125 | 24.8 |
| 44786.041666666664 | 23.46 |
| 44786.052083333336 | 22.76 |
| 44786.0625 | 20.88 |
| 44786.072916666664 | 18.97 |
| 44786.083333333336 | 19.14 |
| 44786.09375 | 18.46 |
| 44786.104166666664 | 19.74 |
| 44786.114583333336 | 16 |
| 44786.125 | 15.54 |
| 44786.135416666664 | 16.2 |
| 44786.145833333336 | 16.75 |
| 44786.15625 | 16.45 |
| 44786.166666666664 | 15.2 |
| 44786.177083333336 | 17.78 |
| 44786.1875 | 17.42 |
| 44786.197916666664 | 20.39 |
| 44786.208333333336 | 26.93 |
| 44786.21875 | 51.11 |
| 44786.229166666664 | 24.45 |
| 44786.239583333336 | 21.67 |
| 44786.25 | 27.8 |
| 44786.260416666664 | 33.82 |
| 44786.270833333336 | 36.75 |
| 44786.28125 | 42.54 |
| 44786.291666666664 | 45.49 |
| 44786.302083333336 | 34.07 |
| 44786.3125 | 36.16 |
| 44786.322916666664 | 34.92 |
| 44786.333333333336 | 29.22 |
| 44786.34375 | 25.27 |
| 44786.354166666664 | 22.83 |
| 44786.364583333336 | 16.37 |
| 44786.375 | 25.85 |
| 44786.385416666664 | 22.5 |
| 44786.395833333336 | 23.15 |
| 44786.40625 | 23.31 |
| 44786.416666666664 | 23.77 |
| 44786.427083333336 | 25.4 |
| 44786.4375 | 27.57 |
| 44786.447916666664 | 28.13 |
| 44786.458333333336 | 30.43 |
| 44786.46875 | 33.54 |
| 44786.479166666664 | 32.73 |
| 44786.489583333336 | 33.84 |
| 44786.5 | 33.78 |
| 44786.510416666664 | 33.53 |
| 44786.520833333336 | 30.23 |
| 44786.53125 | 27.52 |
| 44786.541666666664 | 24.86 |
| 44786.552083333336 | 22.92 |
| 44786.5625 | 22.18 |
| 44786.572916666664 | 21.52 |
| 44786.583333333336 | 19.74 |
| 44786.59375 | 17.77 |
| 44786.604166666664 | 16.55 |
| 44786.614583333336 | 14.03 |
| 44786.625 | 15.17 |
| 44786.635416666664 | 14.8 |
| 44786.645833333336 | 14.39 |
| 44786.65625 | 18.79 |
| 44786.666666666664 | 19.26 |
| 44786.677083333336 | 23.2 |
| 44786.6875 | 25.01 |
| 44786.697916666664 | 27.73 |
| 44786.708333333336 | 31.01 |
| 44786.71875 | 35.92 |
| 44786.729166666664 | 49.69 |
| 44786.739583333336 | 39.98 |
| 44786.75 | 47.32 |
| 44786.760416666664 | 45.3 |
| 44786.770833333336 | 42.08 |
| 44786.78125 | 44.89 |
| 44786.791666666664 | 36.11 |
| 44786.802083333336 | 36.64 |
| 44786.8125 | 29.5 |
| 44786.822916666664 | 29.45 |
| 44786.833333333336 | 26.37 |
| 44786.84375 | 23.49 |
| 44786.854166666664 | 20.47 |
| 44786.864583333336 | 21.99 |
| 44786.875 | 21.68 |
| 44786.885416666664 | 26.96 |
| 44786.895833333336 | 29.71 |
| 44786.90625 | 30.36 |
| 44786.916666666664 | 29.84 |
| 44786.927083333336 | 32.67 |
| 44786.9375 | 29.84 |
| 44786.947916666664 | 31.32 |
| 44786.958333333336 | 31.41 |
| 44786.96875 | 29.5 |
| 44786.979166666664 | 29.86 |
| 44786.989583333336 | 30.86 |
| 44787.0 | 28.05 |
| 44787.010416666664 | 29.03 |
| 44787.020833333336 | 27.07 |
| 44787.03125 | 26.27 |
| 44787.041666666664 | 24.14 |
| 44787.052083333336 | 22.98 |
| 44787.0625 | 18.87 |
| 44787.072916666664 | 20.45 |
| 44787.083333333336 | 19 |
| 44787.09375 | 16.83 |
| 44787.104166666664 | 16.88 |
| 44787.114583333336 | 16.25 |
| 44787.125 | 15.5 |
| 44787.135416666664 | 13.94 |
| 44787.145833333336 | 13.72 |
| 44787.15625 | 13.48 |
| 44787.166666666664 | 15.57 |
| 44787.177083333336 | 14.66 |
| 44787.1875 | 15.54 |
| 44787.197916666664 | 16.68 |
| 44787.208333333336 | 16 |
| 44787.21875 | 17.78 |
| 44787.229166666664 | 20.29 |
| 44787.239583333336 | 22.53 |
| 44787.25 | 22.43 |
| 44787.260416666664 | 27.7 |
| 44787.270833333336 | 27.32 |
| 44787.28125 | 30.19 |
| 44787.291666666664 | 34.04 |
| 44787.302083333336 | 36.79 |
| 44787.3125 | 40.06 |
| 44787.322916666664 | 33.05 |
| 44787.333333333336 | 42.03 |
| 44787.34375 | 36.23 |
| 44787.354166666664 | 28.04 |
| 44787.364583333336 | 24.68 |
| 44787.375 | 23 |
| 44787.385416666664 | 19.58 |
| 44787.395833333336 | 15.03 |
| 44787.40625 | 23.12 |
| 44787.416666666664 | 22.39 |
| 44787.427083333336 | 23.11 |
| 44787.4375 | 25.85 |
| 44787.447916666664 | 24.62 |
| 44787.458333333336 | 26.8 |
| 44787.46875 | 27.05 |
| 44787.479166666664 | 27.48 |
| 44787.489583333336 | 29.39 |
| 44787.5 | 30.76 |
| 44787.510416666664 | 29.75 |
| 44787.520833333336 | 29 |
| 44787.53125 | 29.21 |
| 44787.541666666664 | 28.11 |
| 44787.552083333336 | 26.93 |
| 44787.5625 | 24.99 |
| 44787.572916666664 | 23.44 |
| 44787.583333333336 | 21.41 |
| 44787.59375 | 19.34 |
| 44787.604166666664 | 17.95 |
| 44787.614583333336 | 15.5 |
| 44787.625 | 16.52 |
| 44787.635416666664 | 15.44 |
| 44787.645833333336 | 13.7 |
| 44787.65625 | 12.23 |
| 44787.666666666664 | 11.87 |
| 44787.677083333336 | 12.22 |
| 44787.6875 | 17.56 |
| 44787.697916666664 | 22.15 |
| 44787.708333333336 | 19.63 |
| 44787.71875 | 23.12 |
| 44787.729166666664 | 25.4 |
| 44787.739583333336 | 27.86 |
| 44787.75 | 28.01 |
| 44787.760416666664 | 36.48 |
| 44787.770833333336 | 37.42 |
| 44787.78125 | 39.44 |
| 44787.791666666664 | 36.57 |
| 44787.802083333336 | 42.79 |
| 44787.8125 | 38.43 |
| 44787.822916666664 | 59.43 |
| 44787.833333333336 | 38.03 |
| 44787.84375 | 44.92 |
| 44787.854166666664 | 30.83 |
| 44787.864583333336 | 28.21 |
| 44787.875 | 31.76 |
| 44787.885416666664 | 23.79 |
| 44787.895833333336 | 23 |
| 44787.90625 | 23.63 |
| 44787.916666666664 | 25.88 |
| 44787.927083333336 | 26.45 |
| 44787.9375 | 30.43 |
| 44787.947916666664 | 32.29 |
| 44787.958333333336 | 35.54 |
| 44787.96875 | 30.13 |
| 44787.979166666664 | 29.77 |
| 44787.989583333336 | 27.2 |
| 44788.0 | 27 |
| 44788.010416666664 | 25.99 |
| 44788.020833333336 | 26.13 |
| 44788.03125 | 24.54 |
| 44788.041666666664 | 23.08 |
| 44788.052083333336 | 22.73 |
| 44788.0625 | 22.48 |
| 44788.072916666664 | 20.18 |
| 44788.083333333336 | 20.73 |
| 44788.09375 | 19.18 |
| 44788.104166666664 | 17.91 |
| 44788.114583333336 | 17.81 |
| 44788.125 | 16.39 |
| 44788.135416666664 | 15.73 |
| 44788.145833333336 | 14.26 |
| 44788.15625 | 14.72 |
| 44788.166666666664 | 13.51 |
| 44788.177083333336 | 12.21 |
| 44788.1875 | 12.39 |
| 44788.197916666664 | 13.88 |
| 44788.208333333336 | 14.07 |
| 44788.21875 | 15.49 |
| 44788.229166666664 | 20.6 |
| 44788.239583333336 | 17.07 |
| 44788.25 | 16.84 |
| 44788.260416666664 | 19.39 |
| 44788.270833333336 | 19.58 |
| 44788.28125 | 22.62 |
| 44788.291666666664 | 23.65 |
| 44788.302083333336 | 25.3 |
| 44788.3125 | 27.59 |
| 44788.322916666664 | 31.94 |
| 44788.333333333336 | 34.55 |
| 44788.34375 | 36.66 |
| 44788.354166666664 | 32.4 |
| 44788.364583333336 | 28.91 |
| 44788.375 | 27.75 |
| 44788.385416666664 | 22.58 |
| 44788.395833333336 | 20.22 |
| 44788.40625 | 16.58 |
| 44788.416666666664 | 16.14 |
| 44788.427083333336 | 18.65 |
| 44788.4375 | 24.18 |
| 44788.447916666664 | 21.55 |
| 44788.458333333336 | 20.38 |
| 44788.46875 | 20.82 |
| 44788.479166666664 | 22.52 |
| 44788.489583333336 | 23.14 |
| 44788.5 | 24 |
| 44788.510416666664 | 24.09 |
| 44788.520833333336 | 25.51 |
| 44788.53125 | 26.22 |
| 44788.541666666664 | 26.91 |
| 44788.552083333336 | 27.28 |
| 44788.5625 | 27.06 |
| 44788.572916666664 | 22.66 |
| 44788.583333333336 | 20.63 |
| 44788.59375 | 19.8 |
| 44788.604166666664 | 20.15 |
| 44788.614583333336 | 19.45 |
| 44788.625 | 18.38 |
| 44788.635416666664 | 16.55 |
| 44788.645833333336 | 15.98 |
| 44788.65625 | 16.07 |
| 44788.666666666664 | 14.89 |
| 44788.677083333336 | 13.31 |
| 44788.6875 | 11.71 |
| 44788.697916666664 | 11.7 |
| 44788.708333333336 | 13.13 |
| 44788.71875 | 17.05 |
| 44788.729166666664 | 18.57 |
| 44788.739583333336 | 19.61 |
| 44788.75 | 18.41 |
| 44788.760416666664 | 22.93 |
| 44788.770833333336 | 24.55 |
| 44788.78125 | 20.81 |
| 44788.791666666664 | 26.74 |
| 44788.802083333336 | 31.54 |
| 44788.8125 | 32.18 |
| 44788.822916666664 | 33.5 |
| 44788.833333333336 | 34.41 |
| 44788.84375 | 34.7 |
| 44788.854166666664 | 35.13 |
| 44788.864583333336 | 39.82 |
| 44788.875 | 35.15 |
| 44788.885416666664 | 32.93 |
| 44788.895833333336 | 30.13 |
| 44788.90625 | 28.15 |
| 44788.916666666664 | 27.09 |
| 44788.927083333336 | 22.1 |
| 44788.9375 | 17.77 |
| 44788.947916666664 | 19.74 |
| 44788.958333333336 | 20.97 |
| 44788.96875 | 21.83 |
| 44788.979166666664 | 21.73 |
| 44788.989583333336 | 23.24 |
| 44789.0 | 23.49 |
| 44789.010416666664 | 22.76 |
| 44789.020833333336 | 22.66 |
| 44789.03125 | 23.2 |
| 44789.041666666664 | 23.3 |
| 44789.052083333336 | 22.91 |
| 44789.0625 | 21.47 |
| 44789.072916666664 | 21.14 |
| 44789.083333333336 | 20.67 |
| 44789.09375 | 20.3 |
| 44789.104166666664 | 19.42 |
| 44789.114583333336 | 18.55 |
| 44789.125 | 17.36 |
| 44789.135416666664 | 15.42 |
| 44789.145833333336 | 14.34 |
| 44789.15625 | 14.65 |
| 44789.166666666664 | 12.98 |
| 44789.177083333336 | 12.23 |
| 44789.1875 | 12.36 |
| 44789.197916666664 | 12.65 |
| 44789.208333333336 | 13.75 |
| 44789.21875 | 11.64 |
| 44789.229166666664 | 13.28 |
| 44789.239583333336 | 13.62 |
| 44789.25 | 14.64 |
| 44789.260416666664 | 15.62 |
| 44789.270833333336 | 23.26 |
| 44789.28125 | 21.18 |
| 44789.291666666664 | 17.89 |
| 44789.302083333336 | 21.64 |
| 44789.3125 | 20.52 |
| 44789.322916666664 | 21.85 |
| 44789.333333333336 | 23.39 |
| 44789.34375 | 26.09 |
| 44789.354166666664 | 25.18 |
| 44789.364583333336 | 29.36 |
| 44789.375 | 28.6 |
| 44789.385416666664 | 27.03 |
| 44789.395833333336 | 26.6 |
| 44789.40625 | 26.08 |
| 44789.416666666664 | 20.5 |
| 44789.427083333336 | 18.63 |
| 44789.4375 | 20.26 |
| 44789.447916666664 | 14.65 |
| 44789.458333333336 | 14.81 |
| 44789.46875 | 17.73 |
| 44789.479166666664 | 17.92 |
| 44789.489583333336 | 18.02 |
| 44789.5 | 19.14 |
| 44789.510416666664 | 20.25 |
| 44789.520833333336 | 19.74 |
| 44789.53125 | 21.3 |
| 44789.541666666664 | 22.48 |
| 44789.552083333336 | 25.74 |
| 44789.5625 | 24.61 |
| 44789.572916666664 | 22.84 |
| 44789.583333333336 | 22.61 |
| 44789.59375 | 20.48 |
| 44789.604166666664 | 20.82 |
| 44789.614583333336 | 21.29 |
| 44789.625 | 19.42 |
| 44789.635416666664 | 19.14 |
| 44789.645833333336 | 19.04 |
| 44789.65625 | 18 |
| 44789.666666666664 | 15.33 |
| 44789.677083333336 | 14.76 |
| 44789.6875 | 12.64 |
| 44789.697916666664 | 13.31 |
| 44789.708333333336 | 10.97 |
| 44789.71875 | 11 |
| 44789.729166666664 | 11.88 |
| 44789.739583333336 | 11.76 |
| 44789.75 | 12.18 |
| 44789.760416666664 | 13.98 |
| 44789.770833333336 | 13.23 |
| 44789.78125 | 14.06 |
| 44789.791666666664 | 13.87 |
| 44789.802083333336 | 23.69 |
| 44789.8125 | 24.73 |
| 44789.822916666664 | 23.96 |
| 44789.833333333336 | 28.92 |
| 44789.84375 | 30.74 |
| 44789.854166666664 | 35.4 |
| 44789.864583333336 | 36.66 |
| 44789.875 | 45.84 |
| 44789.885416666664 | 53.68 |
| 44789.895833333336 | 47.05 |
| 44789.90625 | 53.9 |
| 44789.916666666664 | 51.25 |
| 44789.927083333336 | 45.49 |
| 44789.9375 | 43.42 |
| 44789.947916666664 | 39.51 |
| 44789.958333333336 | 31.33 |
| 44789.96875 | 27.82 |
| 44789.979166666664 | 21.6 |
| 44789.989583333336 | 22.02 |
| 44790.0 | 20.49 |
| 44790.010416666664 | 21.24 |
| 44790.020833333336 | 20.6 |
| 44790.03125 | 22.38 |
| 44790.041666666664 | 21.49 |
| 44790.052083333336 | 21.18 |
| 44790.0625 | 19.88 |
| 44790.072916666664 | 20.41 |
| 44790.083333333336 | 19.27 |
| 44790.09375 | 18.11 |
| 44790.104166666664 | 17.87 |
| 44790.114583333336 | 17 |
| 44790.125 | 15.93 |
| 44790.135416666664 | 19.55 |
| 44790.145833333336 | 17.07 |
| 44790.15625 | 15.89 |
| 44790.166666666664 | 14.52 |
| 44790.177083333336 | 14.3 |
| 44790.1875 | 13.23 |
| 44790.197916666664 | 13.66 |
| 44790.208333333336 | 13.31 |
| 44790.21875 | 12.63 |
| 44790.229166666664 | 12.17 |
| 44790.239583333336 | 12.16 |
| 44790.25 | 12.2 |
| 44790.260416666664 | 12.55 |
| 44790.270833333336 | 11.99 |
| 44790.28125 | 13.32 |
| 44790.291666666664 | 14.06 |
| 44790.302083333336 | 14.83 |
| 44790.3125 | 18.87 |
| 44790.322916666664 | 17.22 |
| 44790.333333333336 | 17.57 |
| 44790.34375 | 17.51 |
| 44790.354166666664 | 19.69 |
| 44790.364583333336 | 18.6 |
| 44790.375 | 22.39 |
| 44790.385416666664 | 25.22 |
| 44790.395833333336 | 20.92 |
| 44790.40625 | 22.59 |
| 44790.416666666664 | 22.62 |
| 44790.427083333336 | 21.71 |
| 44790.4375 | 22.11 |
| 44790.447916666664 | 19.65 |
| 44790.458333333336 | 20.24 |
| 44790.46875 | 19.08 |
| 44790.479166666664 | 18.43 |
| 44790.489583333336 | 17.18 |
| 44790.5 | 19.12 |
| 44790.510416666664 | 17.43 |
| 44790.520833333336 | 17.96 |
| 44790.53125 | 18.99 |
| 44790.541666666664 | 19.89 |
| 44790.552083333336 | 21.21 |
| 44790.5625 | 20.01 |
| 44790.572916666664 | 21.48 |
| 44790.583333333336 | 19.98 |
| 44790.59375 | 18.59 |
| 44790.604166666664 | 19.24 |
| 44790.614583333336 | 19.66 |
| 44790.625 | 20.04 |
| 44790.635416666664 | 18.98 |
| 44790.645833333336 | 16.14 |
| 44790.65625 | 15.9 |
| 44790.666666666664 | 14.57 |
| 44790.677083333336 | 15.6 |
| 44790.6875 | 14.97 |
| 44790.697916666664 | 13.63 |
| 44790.708333333336 | 11.39 |
| 44790.71875 | 12.81 |
| 44790.729166666664 | 10.76 |
| 44790.739583333336 | 10.31 |
| 44790.75 | 9.8 |
| 44790.760416666664 | 9.78 |
| 44790.770833333336 | 11.4 |
| 44790.78125 | 12.76 |
| 44790.791666666664 | 13.44 |
| 44790.802083333336 | 14.7 |
| 44790.8125 | 14.47 |
| 44790.822916666664 | 16.55 |
| 44790.833333333336 | 22.53 |
| 44790.84375 | 23.75 |
| 44790.854166666664 | 21.53 |
| 44790.864583333336 | 23.26 |
| 44790.875 | 24.65 |
| 44790.885416666664 | 27.61 |
| 44790.895833333336 | 30.37 |
| 44790.90625 | 31.6 |
| 44790.916666666664 | 28.61 |
| 44790.927083333336 | 34.75 |
| 44790.9375 | 30.83 |
| 44790.947916666664 | 31.01 |
| 44790.958333333336 | 30.2 |
| 44790.96875 | 30.05 |
| 44790.979166666664 | 27.46 |
| 44790.989583333336 | 24.47 |
| 44791.0 | 23.59 |
| 44791.010416666664 | 20.64 |
| 44791.020833333336 | 18.41 |
| 44791.03125 | 19.94 |
| 44791.041666666664 | 19.88 |
| 44791.052083333336 | 19.33 |
| 44791.0625 | 18.91 |
| 44791.072916666664 | 18.45 |
| 44791.083333333336 | 18.13 |
| 44791.09375 | 20.41 |
| 44791.104166666664 | 17.82 |
| 44791.114583333336 | 16.04 |
| 44791.125 | 16.68 |
| 44791.135416666664 | 15.27 |
| 44791.145833333336 | 15.7 |
| 44791.15625 | 14.67 |
| 44791.166666666664 | 15.62 |
| 44791.177083333336 | 14.79 |
| 44791.1875 | 14.66 |
| 44791.197916666664 | 14.47 |
| 44791.208333333336 | 13.41 |
| 44791.21875 | 13.84 |
| 44791.229166666664 | 11.91 |
| 44791.239583333336 | 13.17 |
| 44791.25 | 11.49 |
| 44791.260416666664 | 13.24 |
| 44791.270833333336 | 13.04 |
| 44791.28125 | 12.35 |
| 44791.291666666664 | 11.11 |
| 44791.302083333336 | 10.74 |
| 44791.3125 | 12.75 |
| 44791.322916666664 | 14.71 |
| 44791.333333333336 | 16.29 |
| 44791.34375 | 15.82 |
| 44791.354166666664 | 16.36 |
| 44791.364583333336 | 17.12 |
| 44791.375 | 16.91 |
| 44791.385416666664 | 18.53 |
| 44791.395833333336 | 18.81 |
| 44791.40625 | 16.4 |
| 44791.416666666664 | 18.91 |
| 44791.427083333336 | 19.58 |
| 44791.4375 | 21.56 |
| 44791.447916666664 | 19.33 |
| 44791.458333333336 | 22.13 |
| 44791.46875 | 21.59 |
| 44791.479166666664 | 19.97 |
| 44791.489583333336 | 22.37 |
| 44791.5 | 18.66 |
| 44791.510416666664 | 18.4 |
| 44791.520833333336 | 17.94 |
| 44791.53125 | 20.46 |
| 44791.541666666664 | 20.41 |
| 44791.552083333336 | 19.62 |
| 44791.5625 | 19.11 |
| 44791.572916666664 | 19.42 |
| 44791.583333333336 | 20.25 |
| 44791.59375 | 19.19 |
| 44791.604166666664 | 19.92 |
| 44791.614583333336 | 17.33 |
| 44791.625 | 19.22 |
| 44791.635416666664 | 19.28 |
| 44791.645833333336 | 18.28 |
| 44791.65625 | 13.6 |
| 44791.666666666664 | 17.21 |
| 44791.677083333336 | 16.47 |
| 44791.6875 | 17.41 |
| 44791.697916666664 | 15.38 |
| 44791.708333333336 | 14.47 |
| 44791.71875 | 14.59 |
| 44791.729166666664 | 13.55 |
| 44791.739583333336 | 13.13 |
| 44791.75 | 12.55 |
| 44791.760416666664 | 10.82 |
| 44791.770833333336 | 9.99 |
| 44791.78125 | 9.08 |
| 44791.791666666664 | 8.21 |
| 44791.802083333336 | 9.78 |
| 44791.8125 | 10.6 |
| 44791.822916666664 | 12.38 |
| 44791.833333333336 | 15.55 |
| 44791.84375 | 16.31 |
| 44791.854166666664 | 17.66 |
| 44791.864583333336 | 18.21 |
| 44791.875 | 20.45 |
| 44791.885416666664 | 21.16 |
| 44791.895833333336 | 22.33 |
| 44791.90625 | 22.66 |
| 44791.916666666664 | 24.31 |
| 44791.927083333336 | 25.6 |
| 44791.9375 | 27.39 |
| 44791.947916666664 | 27.08 |
| 44791.958333333336 | 29.36 |
| 44791.96875 | 26.96 |
| 44791.979166666664 | 26 |
| 44791.989583333336 | 26.87 |
| 44792.0 | 22.69 |
| 44792.010416666664 | 21.27 |
| 44792.020833333336 | 18.17 |
| 44792.03125 | 16.83 |
| 44792.041666666664 | 16.23 |
| 44792.052083333336 | 18.01 |
| 44792.0625 | 20.88 |
| 44792.072916666664 | 21.57 |
| 44792.083333333336 | 21.17 |
| 44792.09375 | 19.76 |
| 44792.104166666664 | 20.17 |
| 44792.114583333336 | 16.61 |
| 44792.125 | 19.84 |
| 44792.135416666664 | 19.1 |
| 44792.145833333336 | 19.86 |
| 44792.15625 | 17.96 |
| 44792.166666666664 | 17.41 |
| 44792.177083333336 | 18.46 |
| 44792.1875 | 18.08 |
| 44792.197916666664 | 17.16 |
| 44792.208333333336 | 16.81 |
| 44792.21875 | 16.59 |
| 44792.229166666664 | 17.02 |
| 44792.239583333336 | 17.31 |
| 44792.25 | 16.34 |
| 44792.260416666664 | 15.93 |
| 44792.270833333336 | 15.74 |
| 44792.28125 | 14.44 |
| 44792.291666666664 | 15.38 |
| 44792.302083333336 | 16.18 |
| 44792.3125 | 16.73 |
| 44792.322916666664 | 15.37 |
| 44792.333333333336 | 11.42 |
| 44792.34375 | 15.27 |
| 44792.354166666664 | 19.47 |
| 44792.364583333336 | 20.3 |
| 44792.375 | 19.71 |
| 44792.385416666664 | 19.75 |
| 44792.395833333336 | 18.86 |
| 44792.40625 | 18.91 |
| 44792.416666666664 | 18.09 |
| 44792.427083333336 | 21.78 |
| 44792.4375 | 22.69 |
| 44792.447916666664 | 21.12 |
| 44792.458333333336 | 21.95 |
| 44792.46875 | 24.11 |
| 44792.479166666664 | 21.49 |
| 44792.489583333336 | 31.79 |
| 44792.5 | 22.17 |
| 44792.510416666664 | 22.72 |
| 44792.520833333336 | 23.7 |
| 44792.53125 | 23.08 |
| 44792.541666666664 | 20.96 |
| 44792.552083333336 | 21.85 |
| 44792.5625 | 24.38 |
| 44792.572916666664 | 23.8 |
| 44792.583333333336 | 20.68 |
| 44792.59375 | 189.27 |
| 44792.604166666664 | 20.31 |
| 44792.614583333336 | 23.08 |
| 44792.625 | 20.33 |
| 44792.635416666664 | 19.64 |
| 44792.645833333336 | 18.84 |
| 44792.65625 | 18.61 |
| 44792.666666666664 | 17.58 |
| 44792.677083333336 | 16.63 |
| 44792.6875 | 16.67 |
| 44792.697916666664 | 15.71 |
| 44792.708333333336 | 16.8 |
| 44792.71875 | 17.73 |
| 44792.729166666664 | 16.39 |
| 44792.739583333336 | 16.78 |
| 44792.75 | 17.75 |
| 44792.760416666664 | 15.87 |
| 44792.770833333336 | 15.07 |
| 44792.78125 | 12.31 |
| 44792.791666666664 | 12.32 |
| 44792.802083333336 | 11.26 |
| 44792.8125 | 13.97 |
| 44792.822916666664 | 12.7 |
| 44792.833333333336 | 14.55 |
| 44792.84375 | 11.12 |
| 44792.854166666664 | 10.4 |
| 44792.864583333336 | 16.9 |
| 44792.875 | 19.28 |
| 44792.885416666664 | 18.93 |
| 44792.895833333336 | 22.6 |
| 44792.90625 | 25.14 |
| 44792.916666666664 | 22.61 |
| 44792.927083333336 | 26.97 |
| 44792.9375 | 24.78 |
| 44792.947916666664 | 29.79 |
| 44792.958333333336 | 30.17 |
| 44792.96875 | 31.31 |
| 44792.979166666664 | 32.32 |
| 44792.989583333336 | 30.33 |
| 44793.0 | 24.93 |
| 44793.010416666664 | 20.64 |
| 44793.020833333336 | 22.42 |
| 44793.03125 | 21.72 |
| 44793.041666666664 | 19.86 |
| 44793.052083333336 | 18.44 |
| 44793.0625 | 16.96 |
| 44793.072916666664 | 16.98 |
| 44793.083333333336 | 15.02 |
| 44793.09375 | 14.2 |
| 44793.104166666664 | 17.53 |
| 44793.114583333336 | 18.62 |
| 44793.125 | 19.39 |
| 44793.135416666664 | 19.59 |
| 44793.145833333336 | 18.7 |
| 44793.15625 | 18.74 |
| 44793.166666666664 | 18.55 |
| 44793.177083333336 | 17.92 |
| 44793.1875 | 17.42 |
| 44793.197916666664 | 16.54 |
| 44793.208333333336 | 15.82 |
| 44793.21875 | 14.17 |
| 44793.229166666664 | 15.16 |
| 44793.239583333336 | 14.91 |
| 44793.25 | 14.62 |
| 44793.260416666664 | 14.63 |
| 44793.270833333336 | 13.68 |
| 44793.28125 | 13.18 |
| 44793.291666666664 | 13.64 |
| 44793.302083333336 | 13.79 |
| 44793.3125 | 13.64 |
| 44793.322916666664 | 12.87 |
| 44793.333333333336 | 13.72 |
| 44793.34375 | 14.08 |
| 44793.354166666664 | 13.71 |
| 44793.364583333336 | 12.82 |
| 44793.375 | 12.69 |
| 44793.385416666664 | 16.84 |
| 44793.395833333336 | 16.99 |
| 44793.40625 | 17.84 |
| 44793.416666666664 | 18.73 |
| 44793.427083333336 | 20.49 |
| 44793.4375 | 20.58 |
| 44793.447916666664 | 19.74 |
| 44793.458333333336 | 21.6 |
| 44793.46875 | 20.74 |
| 44793.479166666664 | 20.94 |
| 44793.489583333336 | 21.76 |
| 44793.5 | 19.82 |
| 44793.510416666664 | 18.93 |
| 44793.520833333336 | 17.45 |
| 44793.53125 | 18.77 |
| 44793.541666666664 | 19.05 |
| 44793.552083333336 | 17.77 |
| 44793.5625 | 16.34 |
| 44793.572916666664 | 15.16 |
| 44793.583333333336 | 16.37 |
| 44793.59375 | 14.38 |
| 44793.604166666664 | 17.15 |
| 44793.614583333336 | 17.5 |
| 44793.625 | 18.64 |
| 44793.635416666664 | 18.09 |
| 44793.645833333336 | 17.83 |
| 44793.65625 | 18.5 |
| 44793.666666666664 | 18.46 |
| 44793.677083333336 | 18.53 |
| 44793.6875 | 18.92 |
| 44793.697916666664 | 16.96 |
| 44793.708333333336 | 17.78 |
| 44793.71875 | 16.39 |
| 44793.729166666664 | 16.93 |
| 44793.739583333336 | 15.38 |
| 44793.75 | 13.45 |
| 44793.760416666664 | 13.49 |
| 44793.770833333336 | 15.06 |
| 44793.78125 | 15.17 |
| 44793.791666666664 | 13.14 |
| 44793.802083333336 | 11.25 |
| 44793.8125 | 10.63 |
| 44793.822916666664 | 11.23 |
| 44793.833333333336 | 10.16 |
| 44793.84375 | 9.82 |
| 44793.854166666664 | 8.12 |
| 44793.864583333336 | 7.67 |
| 44793.875 | 7.99 |
| 44793.885416666664 | 8.87 |
| 44793.895833333336 | 13.12 |
| 44793.90625 | 15.08 |
| 44793.916666666664 | 14.92 |
| 44793.927083333336 | 15.65 |
| 44793.9375 | 17.5 |
| 44793.947916666664 | 16.91 |
| 44793.958333333336 | 20.75 |
| 44793.96875 | 21.49 |
| 44793.979166666664 | 21.24 |
| 44793.989583333336 | 21.26 |
| 44794.0 | 23.35 |
| 44794.010416666664 | 25.57 |
| 44794.020833333336 | 24.72 |
| 44794.03125 | 22.98 |
| 44794.041666666664 | 19.81 |
| 44794.052083333336 | 18.68 |
| 44794.0625 | 18.12 |
| 44794.072916666664 | 16.67 |
| 44794.083333333336 | 18.35 |
| 44794.09375 | 15.28 |
| 44794.104166666664 | 13.25 |
| 44794.114583333336 | 13.09 |
| 44794.125 | 11.3 |
| 44794.135416666664 | 16.58 |
| 44794.145833333336 | 16.85 |
| 44794.15625 | 16.92 |
| 44794.166666666664 | 16.05 |
| 44794.177083333336 | 16.24 |
| 44794.1875 | 15.62 |
| 44794.197916666664 | 16.92 |
| 44794.208333333336 | 15.08 |
| 44794.21875 | 15.07 |
| 44794.229166666664 | 14.7 |
| 44794.239583333336 | 15.02 |
| 44794.25 | 14.78 |
| 44794.260416666664 | 14.84 |
| 44794.270833333336 | 12.27 |
| 44794.28125 | 14.21 |
| 44794.291666666664 | 14.47 |
| 44794.302083333336 | 12.77 |
| 44794.3125 | 13.16 |
| 44794.322916666664 | 13.29 |
| 44794.333333333336 | 12.2 |
| 44794.34375 | 12.33 |
| 44794.354166666664 | 12.14 |
| 44794.364583333336 | 10.54 |
| 44794.375 | 12.11 |
| 44794.385416666664 | 11.52 |
| 44794.395833333336 | 12.29 |
| 44794.40625 | 12.53 |
| 44794.416666666664 | 10.33 |
| 44794.427083333336 | 12.14 |
| 44794.4375 | 15.66 |
| 44794.447916666664 | 17.02 |
| 44794.458333333336 | 19.32 |
| 44794.46875 | 18.84 |
| 44794.479166666664 | 21.01 |
| 44794.489583333336 | 20.7 |
| 44794.5 | 21.45 |
| 44794.510416666664 | 20.78 |
| 44794.520833333336 | 20.35 |
| 44794.53125 | 18.95 |
| 44794.541666666664 | 19.32 |
| 44794.552083333336 | 19.61 |
| 44794.5625 | 19.57 |
| 44794.572916666664 | 18.62 |
| 44794.583333333336 | 18.34 |
| 44794.59375 | 18.54 |
| 44794.604166666664 | 15.54 |
| 44794.614583333336 | 14.99 |
| 44794.625 | 16.53 |
| 44794.635416666664 | 15.72 |
| 44794.645833333336 | 16.19 |
| 44794.65625 | 17.52 |
| 44794.666666666664 | 16.36 |
| 44794.677083333336 | 17.88 |
| 44794.6875 | 17.52 |
| 44794.697916666664 | 17.39 |
| 44794.708333333336 | 18.04 |
| 44794.71875 | 17.29 |
| 44794.729166666664 | 18.01 |
| 44794.739583333336 | 16.62 |
| 44794.75 | 15.39 |
| 44794.760416666664 | 16.15 |
| 44794.770833333336 | 14.94 |
| 44794.78125 | 15.17 |
| 44794.791666666664 | 16.42 |
| 44794.802083333336 | 12.12 |
| 44794.8125 | 12.95 |
| 44794.822916666664 | 10.46 |
| 44794.833333333336 | 12.62 |
| 44794.84375 | 11.89 |
| 44794.854166666664 | 8.47 |
| 44794.864583333336 | 12.11 |
| 44794.875 | 10.77 |
| 44794.885416666664 | 9.13 |
| 44794.895833333336 | 10.49 |
| 44794.90625 | 9.16 |
| 44794.916666666664 | 9.1 |
| 44794.927083333336 | 9.15 |
| 44794.9375 | 8.38 |
| 44794.947916666664 | 6.86 |
| 44794.958333333336 | 11.59 |
| 44794.96875 | 13.98 |
| 44794.979166666664 | 15.79 |
| 44794.989583333336 | 16.96 |
| 44795.0 | 19.18 |
| 44795.010416666664 | 20.92 |
| 44795.020833333336 | 19.92 |
| 44795.03125 | 19.64 |
| 44795.041666666664 | 20.72 |
| 44795.052083333336 | 21.11 |
| 44795.0625 | 20.08 |
| 44795.072916666664 | 20.9 |
| 44795.083333333336 | 20.28 |
| 44795.09375 | 17.2 |
| 44795.104166666664 | 17.41 |
| 44795.114583333336 | 15.77 |
| 44795.125 | 13.87 |
| 44795.135416666664 | 15.73 |
| 44795.145833333336 | 13.08 |
| 44795.15625 | 12.5 |
| 44795.166666666664 | 15.09 |
| 44795.177083333336 | 14.84 |
| 44795.1875 | 14.08 |
| 44795.197916666664 | 14.15 |
| 44795.208333333336 | 15.74 |
| 44795.21875 | 15.42 |
| 44795.229166666664 | 15.39 |
| 44795.239583333336 | 13.41 |
| 44795.25 | 13.17 |
| 44795.260416666664 | 12.99 |
| 44795.270833333336 | 13.05 |
| 44795.28125 | 12.92 |
| 44795.291666666664 | 12.15 |
| 44795.302083333336 | 12.82 |
| 44795.3125 | 12.59 |
| 44795.322916666664 | 13.17 |
| 44795.333333333336 | 12.87 |
| 44795.34375 | 13.24 |
| 44795.354166666664 | 14.21 |
| 44795.364583333336 | 13.21 |
| 44795.375 | 13.05 |
| 44795.385416666664 | 12.94 |
| 44795.395833333336 | 12.91 |
| 44795.40625 | 12.35 |
| 44795.416666666664 | 14.78 |
| 44795.427083333336 | 13.13 |
| 44795.4375 | 14.37 |
| 44795.447916666664 | 17.97 |
| 44795.458333333336 | 18.82 |
| 44795.46875 | 16.94 |
| 44795.479166666664 | 16.91 |
| 44795.489583333336 | 15.51 |
| 44795.5 | 19.13 |
| 44795.510416666664 | 20.31 |
| 44795.520833333336 | 19.89 |
| 44795.53125 | 22.29 |
| 44795.541666666664 | 21.86 |
| 44795.552083333336 | 17.87 |
| 44795.5625 | 26.05 |
| 44795.572916666664 | 18.37 |
| 44795.583333333336 | 18.75 |
| 44795.59375 | 19.34 |
| 44795.604166666664 | 19.95 |
| 44795.614583333336 | 21.63 |
| 44795.625 | 16.99 |
| 44795.635416666664 | 16.65 |
| 44795.645833333336 | 13.49 |
| 44795.65625 | 14.56 |
| 44795.666666666664 | 14.22 |
| 44795.677083333336 | 15.98 |
| 44795.6875 | 17.53 |
| 44795.697916666664 | 16.48 |
| 44795.708333333336 | 17.33 |
| 44795.71875 | 17.79 |
| 44795.729166666664 | 19.03 |
| 44795.739583333336 | 17.81 |
| 44795.75 | 18.08 |
| 44795.760416666664 | 17 |
| 44795.770833333336 | 18.48 |
| 44795.78125 | 17.29 |
| 44795.791666666664 | 16.66 |
| 44795.802083333336 | 17.42 |
| 44795.8125 | 12.86 |
| 44795.822916666664 | 13.01 |
| 44795.833333333336 | 12.48 |
| 44795.84375 | 13.81 |
| 44795.854166666664 | 12.74 |
| 44795.864583333336 | 11.38 |
| 44795.875 | 12.83 |
| 44795.885416666664 | 13.23 |
| 44795.895833333336 | 14.04 |
| 44795.90625 | 14.05 |
| 44795.916666666664 | 12.97 |
| 44795.927083333336 | 13.32 |
| 44795.9375 | 11.23 |
| 44795.947916666664 | 9.91 |
| 44795.958333333336 | 10.46 |
| 44795.96875 | 9.85 |
| 44795.979166666664 | 10.46 |
| 44795.989583333336 | 11.61 |
| 44796.0 | 12.71 |
| 44796.010416666664 | 16.85 |
| 44796.020833333336 | 21.17 |
| 44796.03125 | 17.41 |
| 44796.041666666664 | 17.73 |
| 44796.052083333336 | 16.86 |
| 44796.0625 | 19.87 |
| 44796.072916666664 | 18.27 |
| 44796.083333333336 | 19.45 |
| 44796.09375 | 18.51 |
| 44796.104166666664 | 19.2 |
| 44796.114583333336 | 18.83 |
| 44796.125 | 21.18 |
| 44796.135416666664 | 16.51 |
| 44796.145833333336 | 14.07 |
| 44796.15625 | 13.61 |
| 44796.166666666664 | 12.26 |
| 44796.177083333336 | 11.84 |
| 44796.1875 | 11.55 |
| 44796.197916666664 | 10.75 |
| 44796.208333333336 | 11.08 |
| 44796.21875 | 12.52 |
| 44796.229166666664 | 13.09 |
| 44796.239583333336 | 14.05 |
| 44796.25 | 14.78 |
| 44796.260416666664 | 15.01 |
| 44796.270833333336 | 15.21 |
| 44796.28125 | 15.52 |
| 44796.291666666664 | 14.96 |
| 44796.302083333336 | 15.21 |
| 44796.3125 | 15.01 |
| 44796.322916666664 | 14.56 |
| 44796.333333333336 | 13.52 |
| 44796.34375 | 13.66 |
| 44796.354166666664 | 13.49 |
| 44796.364583333336 | 13.73 |
| 44796.375 | 12.6 |
| 44796.385416666664 | 12.35 |
| 44796.395833333336 | 12.98 |
| 44796.40625 | 12.76 |
| 44796.416666666664 | 11.12 |
| 44796.427083333336 | 11.76 |
| 44796.4375 | 11.62 |
| 44796.447916666664 | 10.83 |
| 44796.458333333336 | 12.97 |
| 44796.46875 | 11.99 |
| 44796.479166666664 | 11.82 |
| 44796.489583333336 | 12.47 |
| 44796.5 | 10.09 |
| 44796.510416666664 | 12.49 |
| 44796.520833333336 | 22.67 |
| 44796.53125 | 19.16 |
| 44796.541666666664 | 21.24 |
| 44796.552083333336 | 21.84 |
| 44796.5625 | 20.43 |
| 44796.572916666664 | 21.32 |
| 44796.583333333336 | 21.38 |
| 44796.59375 | 20.77 |
| 44796.604166666664 | 20.72 |
| 44796.614583333336 | 20.44 |
| 44796.625 | 22.79 |
| 44796.635416666664 | 18.4 |
| 44796.645833333336 | 18.52 |
| 44796.65625 | 18.76 |
| 44796.666666666664 | 19.23 |
| 44796.677083333336 | 18.78 |
| 44796.6875 | 15.1 |
| 44796.697916666664 | 16.48 |
| 44796.708333333336 | 14.74 |
| 44796.71875 | 17.04 |
| 44796.729166666664 | 17.13 |
| 44796.739583333336 | 18.71 |
| 44796.75 | 17.93 |
| 44796.760416666664 | 17.34 |
| 44796.770833333336 | 18.95 |
| 44796.78125 | 18.58 |
| 44796.791666666664 | 17.51 |
| 44796.802083333336 | 16.32 |
| 44796.8125 | 16.84 |
| 44796.822916666664 | 15.96 |
| 44796.833333333336 | 16.57 |
| 44796.84375 | 14.93 |
| 44796.854166666664 | 12.48 |
| 44796.864583333336 | 14.23 |
| 44796.875 | 14.29 |
| 44796.885416666664 | 15.9 |
| 44796.895833333336 | 13.39 |
| 44796.90625 | 12.95 |
| 44796.916666666664 | 13.13 |
| 44796.927083333336 | 12.29 |
| 44796.9375 | 11.75 |
| 44796.947916666664 | 17.68 |
| 44796.958333333336 | 11.72 |
| 44796.96875 | 10.69 |
| 44796.979166666664 | 10.15 |
| 44796.989583333336 | 9.79 |
| 44797.0 | 7.69 |
| 44797.010416666664 | 9 |
| 44797.020833333336 | 11.09 |
| 44797.03125 | 12.08 |
| 44797.041666666664 | 14.27 |
| 44797.052083333336 | 13.91 |
| 44797.0625 | 16.53 |
| 44797.072916666664 | 16.64 |
| 44797.083333333336 | 15.42 |
| 44797.09375 | 19.21 |
| 44797.104166666664 | 15.56 |
| 44797.114583333336 | 17.87 |
| 44797.125 | 18.58 |
| 44797.135416666664 | 15.99 |
| 44797.145833333336 | 19.52 |
| 44797.15625 | 17.03 |
| 44797.166666666664 | 15.92 |
| 44797.177083333336 | 16.93 |
| 44797.1875 | 14.77 |
| 44797.197916666664 | 14 |
| 44797.208333333336 | 12.26 |
| 44797.21875 | 15.15 |
| 44797.229166666664 | 11.28 |
| 44797.239583333336 | 11.7 |
| 44797.25 | 11.3 |
| 44797.260416666664 | 12.73 |
| 44797.270833333336 | 12.85 |
| 44797.28125 | 16.1 |
| 44797.291666666664 | 15.11 |
| 44797.302083333336 | 15.67 |
| 44797.3125 | 16.01 |
| 44797.322916666664 | 14.05 |
| 44797.333333333336 | 14.68 |
| 44797.34375 | 15.05 |
| 44797.354166666664 | 14.11 |
| 44797.364583333336 | 13.62 |
| 44797.375 | 14.21 |
| 44797.385416666664 | 14.12 |
| 44797.395833333336 | 12.73 |
| 44797.40625 | 12.83 |
| 44797.416666666664 | 12.78 |
| 44797.427083333336 | 12.61 |
| 44797.4375 | 12.23 |
| 44797.447916666664 | 12.56 |
| 44797.458333333336 | 11.92 |
| 44797.46875 | 8.78 |
| 44797.479166666664 | 10.23 |
| 44797.489583333336 | 14.17 |
| 44797.5 | 11.92 |
| 44797.510416666664 | 12.86 |
| 44797.520833333336 | 11.5 |
| 44797.53125 | 14.75 |
| 44797.541666666664 | 15.97 |
| 44797.552083333336 | 17 |
| 44797.5625 | 16.21 |
| 44797.572916666664 | 17.36 |
| 44797.583333333336 | 18.16 |
| 44797.59375 | 19.6 |
| 44797.604166666664 | 19.13 |
| 44797.614583333336 | 20.76 |
| 44797.625 | 22.78 |
| 44797.635416666664 | 22.25 |
| 44797.645833333336 | 21.87 |
| 44797.65625 | 21.23 |
| 44797.666666666664 | 22.57 |
| 44797.677083333336 | 21.67 |
| 44797.6875 | 23.23 |
| 44797.697916666664 | 21.38 |
| 44797.708333333336 | 19.22 |
| 44797.71875 | 19.84 |
| 44797.729166666664 | 18.88 |
| 44797.739583333336 | 16.56 |
| 44797.75 | 19.68 |
| 44797.760416666664 | 20.57 |
| 44797.770833333336 | 19.02 |
| 44797.78125 | 19.97 |
| 44797.791666666664 | 19.78 |
| 44797.802083333336 | 19.2 |
| 44797.8125 | 19.26 |
| 44797.822916666664 | 19.4 |
| 44797.833333333336 | 17.78 |
| 44797.84375 | 18.13 |
| 44797.854166666664 | 16.44 |
| 44797.864583333336 | 16.44 |
| 44797.875 | 20.36 |
| 44797.885416666664 | 17.15 |
| 44797.895833333336 | 15.67 |
| 44797.90625 | 14.96 |
| 44797.916666666664 | 14.63 |
| 44797.927083333336 | 17.05 |
| 44797.9375 | 17.36 |
| 44797.947916666664 | 13.54 |
| 44797.958333333336 | 13.23 |
| 44797.96875 | 12.46 |
| 44797.979166666664 | 12.33 |
| 44797.989583333336 | 12.14 |
| 44798.0 | 11.88 |
| 44798.010416666664 | 10.03 |
| 44798.020833333336 | 12.11 |
| 44798.03125 | 10.23 |
| 44798.041666666664 | 11.84 |
| 44798.052083333336 | 11.76 |
| 44798.0625 | 13.44 |
| 44798.072916666664 | 12.72 |
| 44798.083333333336 | 12.31 |
| 44798.09375 | 15.7 |
| 44798.104166666664 | 16.8 |
| 44798.114583333336 | 17.13 |
| 44798.125 | 20.96 |
| 44798.135416666664 | 17.62 |
| 44798.145833333336 | 19.87 |
| 44798.15625 | 21.59 |
| 44798.166666666664 | 20.53 |
| 44798.177083333336 | 20.2 |
| 44798.1875 | 17.82 |
| 44798.197916666664 | 18.45 |
| 44798.208333333336 | 17.41 |
| 44798.21875 | 14.45 |
| 44798.229166666664 | 13.94 |
| 44798.239583333336 | 12.76 |
| 44798.25 | 12.01 |
| 44798.260416666664 | 10.65 |
| 44798.270833333336 | 11.47 |
| 44798.28125 | 14.49 |
| 44798.291666666664 | 15.83 |
| 44798.302083333336 | 17.04 |
| 44798.3125 | 17.22 |
| 44798.322916666664 | 15.93 |
| 44798.333333333336 | 15.88 |
| 44798.34375 | 16.35 |
| 44798.354166666664 | 16.71 |
| 44798.364583333336 | 14.94 |
| 44798.375 | 15.74 |
| 44798.385416666664 | 15.12 |
| 44798.395833333336 | 14.61 |
| 44798.40625 | 15.13 |
| 44798.416666666664 | 15.09 |
| 44798.427083333336 | 15.13 |
| 44798.4375 | 14.25 |
| 44798.447916666664 | 14.42 |
| 44798.458333333336 | 15.36 |
| 44798.46875 | 14.96 |
| 44798.479166666664 | 15.07 |
| 44798.489583333336 | 12.9 |
| 44798.5 | 13.11 |
| 44798.510416666664 | 13.01 |
| 44798.520833333336 | 12.93 |
| 44798.53125 | 12.72 |
| 44798.541666666664 | 12.62 |
| 44798.552083333336 | 12.84 |
| 44798.5625 | 14.22 |
| 44798.572916666664 | 15.15 |
| 44798.583333333336 | 20.09 |
| 44798.59375 | 16.13 |
| 44798.604166666664 | 17.75 |
| 44798.614583333336 | 20.03 |
| 44798.625 | 18.09 |
| 44798.635416666664 | 21.67 |
| 44798.645833333336 | 20.35 |
| 44798.65625 | 20.51 |
| 44798.666666666664 | 22.54 |
| 44798.677083333336 | 20.66 |
| 44798.6875 | 21.99 |
| 44798.697916666664 | 22.78 |
| 44798.708333333336 | 20.47 |
| 44798.71875 | 18.55 |
| 44798.729166666664 | 17.07 |
| 44798.739583333336 | 16.95 |
| 44798.75 | 17.17 |
| 44798.760416666664 | 14.75 |
| 44798.770833333336 | 16.93 |
| 44798.78125 | 18.61 |
| 44798.791666666664 | 22.1 |
| 44798.802083333336 | 21.65 |
| 44798.8125 | 20.79 |
| 44798.822916666664 | 22.12 |
| 44798.833333333336 | 25.72 |
| 44798.84375 | 20.29 |
| 44798.854166666664 | 20.65 |
| 44798.864583333336 | 21.3 |
| 44798.875 | 18.88 |
| 44798.885416666664 | 22.23 |
| 44798.895833333336 | 20.62 |
| 44798.90625 | 19.31 |
| 44798.916666666664 | 22.38 |
| 44798.927083333336 | 19.02 |
| 44798.9375 | 16.79 |
| 44798.947916666664 | 13.08 |
| 44798.958333333336 | 16.12 |
| 44798.96875 | 12.87 |
| 44798.979166666664 | 14.05 |
| 44798.989583333336 | 14.85 |
| 44799.0 | 12.5 |
| 44799.010416666664 | 13.71 |
| 44799.020833333336 | 14.74 |
| 44799.03125 | 14.32 |
| 44799.041666666664 | 13.57 |
| 44799.052083333336 | 12.16 |
| 44799.0625 | 11.71 |
| 44799.072916666664 | 10.03 |
| 44799.083333333336 | 11.15 |
| 44799.09375 | 10.02 |
| 44799.104166666664 | 11.76 |
| 44799.114583333336 | 13.95 |
| 44799.125 | 16.67 |
| 44799.135416666664 | 18.89 |
| 44799.145833333336 | 16.14 |
| 44799.15625 | 15.99 |
| 44799.166666666664 | 18.21 |
| 44799.177083333336 | 16.39 |
| 44799.1875 | 18.88 |
| 44799.197916666664 | 20.9 |
| 44799.208333333336 | 18.52 |
| 44799.21875 | 22.41 |
| 44799.229166666664 | 17.81 |
| 44799.239583333336 | 17.26 |
| 44799.25 | 17.5 |
| 44799.260416666664 | 14.68 |
| 44799.270833333336 | 14.18 |
| 44799.28125 | 12.85 |
| 44799.291666666664 | 11.28 |
| 44799.302083333336 | 15.15 |
| 44799.3125 | 17.5 |
| 44799.322916666664 | 16.49 |
| 44799.333333333336 | 16.78 |
| 44799.34375 | 16.48 |
| 44799.354166666664 | 15.48 |
| 44799.364583333336 | 16.05 |
| 44799.375 | 15.92 |
| 44799.385416666664 | 16.41 |
| 44799.395833333336 | 17.03 |
| 44799.40625 | 15.87 |
| 44799.416666666664 | 15.43 |
| 44799.427083333336 | 16.49 |
| 44799.4375 | 16.81 |
| 44799.447916666664 | 15.91 |
| 44799.458333333336 | 15.65 |
| 44799.46875 | 15.67 |
| 44799.479166666664 | 15.32 |
| 44799.489583333336 | 17.45 |
| 44799.5 | 15.11 |
| 44799.510416666664 | 14.99 |
| 44799.520833333336 | 14.34 |
| 44799.53125 | 13.27 |
| 44799.541666666664 | 11.36 |
| 44799.552083333336 | 12.37 |
| 44799.5625 | 12.62 |
| 44799.572916666664 | 10.52 |
| 44799.583333333336 | 11.29 |
| 44799.59375 | 14.62 |
| 44799.604166666664 | 20.27 |
| 44799.614583333336 | 20.35 |
| 44799.625 | 22.96 |
| 44799.635416666664 | 23.06 |
| 44799.645833333336 | 23.44 |
| 44799.65625 | 23.79 |
| 44799.666666666664 | 23.25 |
| 44799.677083333336 | 25.26 |
| 44799.6875 | 22.88 |
| 44799.697916666664 | 23.21 |
| 44799.708333333336 | 21.63 |
| 44799.71875 | 20.96 |
| 44799.729166666664 | 20.96 |
| 44799.739583333336 | 19.35 |
| 44799.75 | 19.49 |
| 44799.760416666664 | 18.98 |
| 44799.770833333336 | 18.61 |
| 44799.78125 | 15.46 |
| 44799.791666666664 | 16.94 |
| 44799.802083333336 | 18.95 |
| 44799.8125 | 19.47 |
| 44799.822916666664 | 20.24 |
| 44799.833333333336 | 20.93 |
| 44799.84375 | 20.31 |
| 44799.854166666664 | 21.88 |
| 44799.864583333336 | 22.1 |
| 44799.875 | 23.34 |
| 44799.885416666664 | 24.19 |
| 44799.895833333336 | 19.81 |
| 44799.90625 | 20 |
| 44799.916666666664 | 21.25 |
| 44799.927083333336 | 21.75 |
| 44799.9375 | 21.18 |
| 44799.947916666664 | 19.45 |
| 44799.958333333336 | 18.12 |
| 44799.96875 | 18.73 |
| 44799.979166666664 | 16.7 |
| 44799.989583333336 | 16.43 |
| 44800.0 | 14.13 |
| 44800.010416666664 | 13.57 |
| 44800.020833333336 | 14.75 |
| 44800.03125 | 15.73 |
| 44800.041666666664 | 12.85 |
| 44800.052083333336 | 14.95 |
| 44800.0625 | 13.33 |
| 44800.072916666664 | 11.77 |
| 44800.083333333336 | 12.03 |
| 44800.09375 | 9.84 |
| 44800.104166666664 | 10.33 |
| 44800.114583333336 | 9.36 |
| 44800.125 | 11.27 |
| 44800.135416666664 | 13.17 |
| 44800.145833333336 | 13.77 |
| 44800.15625 | 14 |
| 44800.166666666664 | 13.4 |
| 44800.177083333336 | 14.95 |
| 44800.1875 | 16.51 |
| 44800.197916666664 | 17.3 |
| 44800.208333333336 | 19.4 |
| 44800.21875 | 18.15 |
| 44800.229166666664 | 22.03 |
| 44800.239583333336 | 17.67 |
| 44800.25 | 18.17 |
| 44800.260416666664 | 16.68 |
| 44800.270833333336 | 17.81 |
| 44800.28125 | 15.77 |
| 44800.291666666664 | 13.67 |
| 44800.302083333336 | 14.3 |
| 44800.3125 | 13.46 |
| 44800.322916666664 | 15.56 |
| 44800.333333333336 | 25.19 |
| 44800.34375 | 28.33 |
| 44800.354166666664 | 20.4 |
| 44800.364583333336 | 16.4 |
| 44800.375 | 18.42 |
| 44800.385416666664 | 18.41 |
| 44800.395833333336 | 18.53 |
| 44800.40625 | 18.21 |
| 44800.416666666664 | 17.88 |
| 44800.427083333336 | 17.46 |
| 44800.4375 | 18.07 |
| 44800.447916666664 | 17.79 |
| 44800.458333333336 | 17.19 |
| 44800.46875 | 17.47 |
| 44800.479166666664 | 16.87 |
| 44800.489583333336 | 14.93 |
| 44800.5 | 15.49 |
| 44800.510416666664 | 15.16 |
| 44800.520833333336 | 14.23 |
| 44800.53125 | 13.89 |
| 44800.541666666664 | 15.1 |
| 44800.552083333336 | 12.08 |
| 44800.5625 | 10 |
| 44800.572916666664 | 8.96 |
| 44800.583333333336 | 7.48 |
| 44800.59375 | 9.27 |
| 44800.604166666664 | 7.85 |
| 44800.614583333336 | 10.62 |
| 44800.625 | 18.72 |
| 44800.635416666664 | 17.92 |
| 44800.645833333336 | 22.61 |
| 44800.65625 | 19.42 |
| 44800.666666666664 | 23.45 |
| 44800.677083333336 | 22.72 |
| 44800.6875 | 26.41 |
| 44800.697916666664 | 25.75 |
| 44800.708333333336 | 24.48 |
| 44800.71875 | 24.81 |
| 44800.729166666664 | 24.1 |
| 44800.739583333336 | 23.04 |
| 44800.75 | 22.6 |
| 44800.760416666664 | 20.82 |
| 44800.770833333336 | 22.03 |
| 44800.78125 | 21.19 |
| 44800.791666666664 | 20.3 |
| 44800.802083333336 | 18.13 |
| 44800.8125 | 19.81 |
| 44800.822916666664 | 16.68 |
| 44800.833333333336 | 16.48 |
| 44800.84375 | 18.19 |
| 44800.854166666664 | 22.27 |
| 44800.864583333336 | 22.19 |
| 44800.875 | 22.56 |
| 44800.885416666664 | 21.51 |
| 44800.895833333336 | 23.64 |
| 44800.90625 | 20.91 |
| 44800.916666666664 | 21.18 |
| 44800.927083333336 | 19.76 |
| 44800.9375 | 19.55 |
| 44800.947916666664 | 19.76 |
| 44800.958333333336 | 16.75 |
| 44800.96875 | 20.4 |
| 44800.979166666664 | 21.88 |
| 44800.989583333336 | 17.92 |
| 44801.0 | 17.73 |
| 44801.010416666664 | 15.1 |
| 44801.020833333336 | 21.66 |
| 44801.03125 | 15.43 |
| 44801.041666666664 | 14.11 |
| 44801.052083333336 | 13.87 |
| 44801.0625 | 10.43 |
| 44801.072916666664 | 12.62 |
| 44801.083333333336 | 12.35 |
| 44801.09375 | 9.8 |
| 44801.104166666664 | 9.96 |
| 44801.114583333336 | 8.18 |
| 44801.125 | 8.45 |
| 44801.135416666664 | 7.94 |
| 44801.145833333336 | 8.47 |
| 44801.15625 | 10.99 |
| 44801.166666666664 | 10.44 |
| 44801.177083333336 | 12.47 |
| 44801.1875 | 13.97 |
| 44801.197916666664 | 16.27 |
| 44801.208333333336 | 15.47 |
| 44801.21875 | 18.13 |
| 44801.229166666664 | 18.23 |
| 44801.239583333336 | 18.56 |
| 44801.25 | 19.43 |
| 44801.260416666664 | 21.37 |
| 44801.270833333336 | 18.61 |
| 44801.28125 | 17.26 |
| 44801.291666666664 | 17.85 |
| 44801.302083333336 | 14.88 |
| 44801.3125 | 15.7 |
| 44801.322916666664 | 14.74 |
| 44801.333333333336 | 12.59 |
| 44801.34375 | 11.04 |
| 44801.354166666664 | 15.81 |
| 44801.364583333336 | 16.77 |
| 44801.375 | 16.67 |
| 44801.385416666664 | 15.74 |
| 44801.395833333336 | 17.34 |
| 44801.40625 | 16.87 |
| 44801.416666666664 | 16.04 |
| 44801.427083333336 | 19.38 |
| 44801.4375 | 16.18 |
| 44801.447916666664 | 17.29 |
| 44801.458333333336 | 18.01 |
| 44801.46875 | 17.71 |
| 44801.479166666664 | 17.69 |
| 44801.489583333336 | 18.02 |
| 44801.5 | 16.51 |
| 44801.510416666664 | 16.96 |
| 44801.520833333336 | 16.59 |
| 44801.53125 | 17.09 |
| 44801.541666666664 | 16.26 |
| 44801.552083333336 | 15.16 |
| 44801.5625 | 14.16 |
| 44801.572916666664 | 10.42 |
| 44801.583333333336 | 9.59 |
| 44801.59375 | 8.74 |
| 44801.604166666664 | 8.73 |
| 44801.614583333336 | 8.41 |
| 44801.625 | 8.3 |
| 44801.635416666664 | 9.06 |
| 44801.645833333336 | 13.12 |
| 44801.65625 | 17.89 |
| 44801.666666666664 | 18.12 |
| 44801.677083333336 | 27.53 |
| 44801.6875 | 23.4 |
| 44801.697916666664 | 21.18 |
| 44801.708333333336 | 26.59 |
| 44801.71875 | 28.18 |
| 44801.729166666664 | 30.23 |
| 44801.739583333336 | 30.48 |
| 44801.75 | 28.73 |
| 44801.760416666664 | 26.37 |
| 44801.770833333336 | 27.08 |
| 44801.78125 | 25.55 |
| 44801.791666666664 | 25.41 |
| 44801.802083333336 | 24.08 |
| 44801.8125 | 22.85 |
| 44801.822916666664 | 23.85 |
| 44801.833333333336 | 22.1 |
| 44801.84375 | 19.98 |
| 44801.854166666664 | 18.8 |
| 44801.864583333336 | 17.91 |
| 44801.875 | 21.53 |
| 44801.885416666664 | 20.37 |
| 44801.895833333336 | 21.99 |
| 44801.90625 | 21.76 |
| 44801.916666666664 | 20.1 |
| 44801.927083333336 | 19.75 |
| 44801.9375 | 19.45 |
| 44801.947916666664 | 18.9 |
| 44801.958333333336 | 16.68 |
| 44801.96875 | 17.64 |
| 44801.979166666664 | 16.58 |
| 44801.989583333336 | 16.96 |
| 44802.0 | 15.63 |
| 44802.010416666664 | 14.69 |
| 44802.020833333336 | 13.64 |
| 44802.03125 | 13.32 |
| 44802.041666666664 | 12.56 |
| 44802.052083333336 | 12.22 |
| 44802.0625 | 12.78 |
| 44802.072916666664 | 12.85 |
| 44802.083333333336 | 11.47 |
| 44802.09375 | 11.42 |
| 44802.104166666664 | 11.47 |
| 44802.114583333336 | 8.78 |
| 44802.125 | 9.47 |
| 44802.135416666664 | 8.1 |
| 44802.145833333336 | 7.24 |
| 44802.15625 | 8.22 |
| 44802.166666666664 | 8.07 |
| 44802.177083333336 | 9.91 |
| 44802.1875 | 9.51 |
| 44802.197916666664 | 10.37 |
| 44802.208333333336 | 12.79 |
| 44802.21875 | 12.03 |
| 44802.229166666664 | 16.96 |
| 44802.239583333336 | 14.6 |
| 44802.25 | 14.03 |
| 44802.260416666664 | 19.11 |
| 44802.270833333336 | 20.11 |
| 44802.28125 | 18.57 |
| 44802.291666666664 | 18.28 |
| 44802.302083333336 | 17.34 |
| 44802.3125 | 17.38 |
| 44802.322916666664 | 15.8 |
| 44802.333333333336 | 15.48 |
| 44802.34375 | 14.42 |
| 44802.354166666664 | 14.47 |
| 44802.364583333336 | 11.79 |
| 44802.375 | 14.38 |
| 44802.385416666664 | 17.27 |
| 44802.395833333336 | 14.74 |
| 44802.40625 | 15.76 |
| 44802.416666666664 | 15.4 |
| 44802.427083333336 | 15.02 |
| 44802.4375 | 15.03 |
| 44802.447916666664 | 15.63 |
| 44802.458333333336 | 15.38 |
| 44802.46875 | 16.86 |
| 44802.479166666664 | 17.18 |
| 44802.489583333336 | 16.6 |
| 44802.5 | 16.59 |
| 44802.510416666664 | 16.87 |
| 44802.520833333336 | 15.79 |
| 44802.53125 | 15.73 |
| 44802.541666666664 | 13.85 |
| 44802.552083333336 | 14.4 |
| 44802.5625 | 13.6 |
| 44802.572916666664 | 12.56 |
| 44802.583333333336 | 13.14 |
| 44802.59375 | 12.69 |
| 44802.604166666664 | 10.61 |
| 44802.614583333336 | 9.25 |
| 44802.625 | 7.75 |
| 44802.635416666664 | 7.66 |
| 44802.645833333336 | 7.87 |
| 44802.65625 | 9.36 |
| 44802.666666666664 | 11.4 |
| 44802.677083333336 | 14.47 |
| 44802.6875 | 14.93 |
| 44802.697916666664 | 17 |
| 44802.708333333336 | 19.96 |
| 44802.71875 | 26.15 |
| 44802.729166666664 | 24.23 |
| 44802.739583333336 | 28.5 |
| 44802.75 | 30.91 |
| 44802.760416666664 | 30.95 |
| 44802.770833333336 | 31.68 |
| 44802.78125 | 31 |
| 44802.791666666664 | 28.99 |
| 44802.802083333336 | 26.28 |
| 44802.8125 | 26.43 |
| 44802.822916666664 | 24.8 |
| 44802.833333333336 | 24.77 |
| 44802.84375 | 24.49 |
| 44802.854166666664 | 20.67 |
| 44802.864583333336 | 19.89 |
| 44802.875 | 17.87 |
| 44802.885416666664 | 18.2 |
| 44802.895833333336 | 16.93 |
| 44802.90625 | 19.38 |
| 44802.916666666664 | 20.02 |
| 44802.927083333336 | 21.26 |
| 44802.9375 | 20.2 |
| 44802.947916666664 | 20.31 |
| 44802.958333333336 | 22.04 |
| 44802.96875 | 19.93 |
| 44802.979166666664 | 17.15 |
| 44802.989583333336 | 20.9 |
| 44803.0 | 18.25 |
| 44803.010416666664 | 18.89 |
| 44803.020833333336 | 15.19 |
| 44803.03125 | 16.66 |
| 44803.041666666664 | 13.74 |
| 44803.052083333336 | 13.61 |
| 44803.0625 | 13.28 |
| 44803.072916666664 | 12.56 |
| 44803.083333333336 | 13.94 |
| 44803.09375 | 12.87 |
| 44803.104166666664 | 12.2 |
| 44803.114583333336 | 12.24 |
| 44803.125 | 11.92 |
| 44803.135416666664 | 11.34 |
| 44803.145833333336 | 10.14 |
| 44803.15625 | 10.99 |
| 44803.166666666664 | 8.75 |
| 44803.177083333336 | 8.29 |
| 44803.1875 | 10.26 |
| 44803.197916666664 | 10.55 |
| 44803.208333333336 | 12.43 |
| 44803.21875 | 14.19 |
| 44803.229166666664 | 15.1 |
| 44803.239583333336 | 19.04 |
| 44803.25 | 18.35 |
| 44803.260416666664 | 18.81 |
| 44803.270833333336 | 20.72 |
| 44803.28125 | 21.03 |
| 44803.291666666664 | 21.62 |
| 44803.302083333336 | 23.26 |
| 44803.3125 | 21.29 |
| 44803.322916666664 | 19.51 |
| 44803.333333333336 | 19.5 |
| 44803.34375 | 16.81 |
| 44803.354166666664 | 16.34 |
| 44803.364583333336 | 16.44 |
| 44803.375 | 12.81 |
| 44803.385416666664 | 14.17 |
| 44803.395833333336 | 10.73 |
| 44803.40625 | 15.49 |
| 44803.416666666664 | 16.46 |
| 44803.427083333336 | 14.65 |
| 44803.4375 | 13.26 |
| 44803.447916666664 | 15.93 |
| 44803.458333333336 | 17.16 |
| 44803.46875 | 17.94 |
| 44803.479166666664 | 17.71 |
| 44803.489583333336 | 18.17 |
| 44803.5 | 20.48 |
| 44803.510416666664 | 17.68 |
| 44803.520833333336 | 19.4 |
| 44803.53125 | 19.88 |
| 44803.541666666664 | 17.87 |
| 44803.552083333336 | 17.94 |
| 44803.5625 | 18.62 |
| 44803.572916666664 | 11.94 |
| 44803.583333333336 | 14.86 |
| 44803.59375 | 12.94 |
| 44803.604166666664 | 11.28 |
| 44803.614583333336 | 11.56 |
| 44803.625 | 10.82 |
| 44803.635416666664 | 9.25 |
| 44803.645833333336 | 9.16 |
| 44803.65625 | 7.66 |
| 44803.666666666664 | 6.6 |
| 44803.677083333336 | 7.44 |
| 44803.6875 | 6.63 |
| 44803.697916666664 | 13.57 |
| 44803.708333333336 | 15.81 |
| 44803.71875 | 19.51 |
| 44803.729166666664 | 21.39 |
| 44803.739583333336 | 22.59 |
| 44803.75 | 23.06 |
| 44803.760416666664 | 24.2 |
| 44803.770833333336 | 24.25 |
| 44803.78125 | 26.6 |
| 44803.791666666664 | 29.28 |
| 44803.802083333336 | 31.27 |
| 44803.8125 | 28.41 |
| 44803.822916666664 | 26.4 |
| 44803.833333333336 | 26.33 |
| 44803.84375 | 26.81 |
| 44803.854166666664 | 23.26 |
| 44803.864583333336 | 21.98 |
| 44803.875 | 22.5 |
| 44803.885416666664 | 20.51 |
| 44803.895833333336 | 19.6 |
| 44803.90625 | 16.74 |
| 44803.916666666664 | 17.94 |
| 44803.927083333336 | 21.57 |
| 44803.9375 | 21.81 |
| 44803.947916666664 | 21.13 |
| 44803.958333333336 | 22.6 |
| 44803.96875 | 23.76 |
| 44803.979166666664 | 25.27 |
| 44803.989583333336 | 26.47 |
| 44804.0 | 26.65 |
| 44804.010416666664 | 24.19 |
| 44804.020833333336 | 26.76 |
| 44804.03125 | 18.58 |
| 44804.041666666664 | 21.98 |
| 44804.052083333336 | 19.64 |
| 44804.0625 | 19.79 |
| 44804.072916666664 | 18.35 |
| 44804.083333333336 | 15.01 |
| 44804.09375 | 14.96 |
| 44804.104166666664 | 14.32 |
| 44804.114583333336 | 13.55 |
| 44804.125 | 13 |
| 44804.135416666664 | 20.52 |
| 44804.145833333336 | 11.5 |
| 44804.15625 | 12.12 |
| 44804.166666666664 | 10.08 |
| 44804.177083333336 | 11.12 |
| 44804.1875 | 8.8 |
| 44804.197916666664 | 11.26 |
| 44804.208333333336 | 17.06 |
| 44804.21875 | 14.04 |
| 44804.229166666664 | 15.08 |
| 44804.239583333336 | 16.42 |
| 44804.25 | 16.58 |
| 44804.260416666664 | 16.94 |
| 44804.270833333336 | 18.1 |
| 44804.28125 | 19.93 |
| 44804.291666666664 | 21.65 |
| 44804.302083333336 | 22.15 |
| 44804.3125 | 21.09 |
| 44804.322916666664 | 22.45 |
| 44804.333333333336 | 16.13 |
| 44804.34375 | 17.78 |
| 44804.354166666664 | 14.3 |
| 44804.364583333336 | 14.08 |
| 44804.375 | 13.09 |
| 44804.385416666664 | 14.68 |
| 44804.395833333336 | 11.75 |
| 44804.40625 | 11.31 |
| 44804.416666666664 | 10.66 |
| 44804.427083333336 | 11.35 |
| 44804.4375 | 15.49 |
| 44804.447916666664 | 16.82 |
| 44804.458333333336 | 16.43 |
| 44804.46875 | 16.6 |
| 44804.479166666664 | 17.06 |
| 44804.489583333336 | 19.81 |
| 44804.5 | 18.55 |
| 44804.510416666664 | 19.2 |
| 44804.520833333336 | 20.9 |
| 44804.53125 | 19.86 |
| 44804.541666666664 | 26.73 |
| 44804.552083333336 | 18.87 |
| 44804.5625 | 18.59 |
| 44804.572916666664 | 17.37 |
| 44804.583333333336 | 14.12 |
| 44804.59375 | 15.84 |
| 44804.604166666664 | 18.2 |
| 44804.614583333336 | 14.23 |
| 44804.625 | 14.47 |
| 44804.635416666664 | 12.91 |
| 44804.645833333336 | 11.94 |
| 44804.65625 | 10.9 |
| 44804.666666666664 | 10.38 |
| 44804.677083333336 | 9.64 |
| 44804.6875 | 9.15 |
| 44804.697916666664 | 7.79 |
| 44804.708333333336 | 8.81 |
| 44804.71875 | 11.86 |
| 44804.729166666664 | 12.32 |
| 44804.739583333336 | 15.55 |
| 44804.75 | 18.63 |
| 44804.760416666664 | 17.28 |
| 44804.770833333336 | 23.31 |
| 44804.78125 | 22.17 |
| 44804.791666666664 | 21.65 |
| 44804.802083333336 | 27.35 |
| 44804.8125 | 29.18 |
| 44804.822916666664 | 31.25 |
| 44804.833333333336 | 31.4 |
| 44804.84375 | 35.19 |
| 44804.854166666664 | 31.51 |
| 44804.864583333336 | 28.64 |
| 44804.875 | 32.94 |
| 44804.885416666664 | 25.17 |
| 44804.895833333336 | 23.54 |
| 44804.90625 | 22.64 |
| 44804.916666666664 | 19.78 |
| 44804.927083333336 | 18.52 |
| 44804.9375 | 22.67 |
| 44804.947916666664 | 19.06 |
| 44804.958333333336 | 24.46 |
| 44804.96875 | 22.27 |
| 44804.979166666664 | 21.95 |
| 44804.989583333336 | 22.21 |
| 44805.0 | 21.63 |
| 44805.010416666664 | 21.22 |
| 44805.020833333336 | 21.67 |
| 44805.03125 | 20.87 |
| 44805.041666666664 | 17.01 |
| 44805.052083333336 | 19.31 |
| 44805.0625 | 17.62 |
| 44805.072916666664 | 21.47 |
| 44805.083333333336 | 17.6 |
| 44805.09375 | 17.88 |
| 44805.104166666664 | 13.46 |
| 44805.114583333336 | 15.63 |
| 44805.125 | 13.75 |
| 44805.135416666664 | 14.51 |
| 44805.145833333336 | 13.04 |